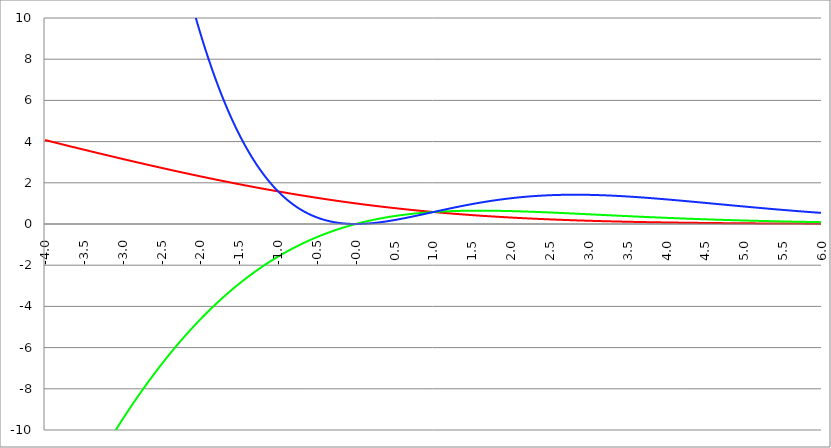
| Category | Series 1 | Series 0 | Series 2 |
|---|---|---|---|
| -4.0 | 4.075 | -16.299 | 65.194 |
| -3.995 | 4.07 | -16.259 | 64.956 |
| -3.99 | 4.065 | -16.22 | 64.718 |
| -3.985 | 4.06 | -16.181 | 64.482 |
| -3.98 | 4.056 | -16.142 | 64.245 |
| -3.975000000000001 | 4.051 | -16.103 | 64.01 |
| -3.970000000000001 | 4.046 | -16.064 | 63.774 |
| -3.965000000000001 | 4.042 | -16.025 | 63.54 |
| -3.960000000000001 | 4.037 | -15.986 | 63.306 |
| -3.955000000000001 | 4.032 | -15.948 | 63.073 |
| -3.950000000000001 | 4.028 | -15.909 | 62.84 |
| -3.945000000000001 | 4.023 | -15.87 | 62.608 |
| -3.940000000000001 | 4.018 | -15.831 | 62.376 |
| -3.935000000000001 | 4.013 | -15.793 | 62.145 |
| -3.930000000000001 | 4.009 | -15.754 | 61.915 |
| -3.925000000000002 | 4.004 | -15.716 | 61.685 |
| -3.920000000000002 | 3.999 | -15.677 | 61.456 |
| -3.915000000000002 | 3.995 | -15.639 | 61.227 |
| -3.910000000000002 | 3.99 | -15.601 | 60.999 |
| -3.905000000000002 | 3.985 | -15.562 | 60.771 |
| -3.900000000000002 | 3.981 | -15.524 | 60.545 |
| -3.895000000000002 | 3.976 | -15.486 | 60.318 |
| -3.890000000000002 | 3.971 | -15.448 | 60.092 |
| -3.885000000000002 | 3.967 | -15.41 | 59.867 |
| -3.880000000000002 | 3.962 | -15.372 | 59.643 |
| -3.875000000000003 | 3.957 | -15.334 | 59.419 |
| -3.870000000000003 | 3.952 | -15.296 | 59.195 |
| -3.865000000000003 | 3.948 | -15.258 | 58.972 |
| -3.860000000000003 | 3.943 | -15.22 | 58.75 |
| -3.855000000000003 | 3.938 | -15.182 | 58.529 |
| -3.850000000000003 | 3.934 | -15.145 | 58.307 |
| -3.845000000000003 | 3.929 | -15.107 | 58.087 |
| -3.840000000000003 | 3.924 | -15.069 | 57.867 |
| -3.835000000000003 | 3.92 | -15.032 | 57.647 |
| -3.830000000000004 | 3.915 | -14.994 | 57.429 |
| -3.825000000000004 | 3.91 | -14.957 | 57.21 |
| -3.820000000000004 | 3.906 | -14.92 | 56.993 |
| -3.815000000000004 | 3.901 | -14.882 | 56.776 |
| -3.810000000000004 | 3.896 | -14.845 | 56.559 |
| -3.805000000000004 | 3.892 | -14.808 | 56.343 |
| -3.800000000000004 | 3.887 | -14.77 | 56.128 |
| -3.795000000000004 | 3.882 | -14.733 | 55.913 |
| -3.790000000000004 | 3.878 | -14.696 | 55.698 |
| -3.785000000000004 | 3.873 | -14.659 | 55.485 |
| -3.780000000000005 | 3.868 | -14.622 | 55.272 |
| -3.775000000000005 | 3.864 | -14.585 | 55.059 |
| -3.770000000000005 | 3.859 | -14.548 | 54.847 |
| -3.765000000000005 | 3.854 | -14.511 | 54.635 |
| -3.760000000000005 | 3.85 | -14.475 | 54.425 |
| -3.755000000000005 | 3.845 | -14.438 | 54.214 |
| -3.750000000000005 | 3.84 | -14.401 | 54.004 |
| -3.745000000000005 | 3.836 | -14.365 | 53.795 |
| -3.740000000000005 | 3.831 | -14.328 | 53.587 |
| -3.735000000000006 | 3.826 | -14.291 | 53.378 |
| -3.730000000000006 | 3.822 | -14.255 | 53.171 |
| -3.725000000000006 | 3.817 | -14.218 | 52.964 |
| -3.720000000000006 | 3.812 | -14.182 | 52.757 |
| -3.715000000000006 | 3.808 | -14.146 | 52.551 |
| -3.710000000000006 | 3.803 | -14.109 | 52.346 |
| -3.705000000000006 | 3.798 | -14.073 | 52.141 |
| -3.700000000000006 | 3.794 | -14.037 | 51.937 |
| -3.695000000000006 | 3.789 | -14.001 | 51.733 |
| -3.690000000000006 | 3.785 | -13.965 | 51.53 |
| -3.685000000000007 | 3.78 | -13.929 | 51.328 |
| -3.680000000000007 | 3.775 | -13.893 | 51.126 |
| -3.675000000000007 | 3.771 | -13.857 | 50.924 |
| -3.670000000000007 | 3.766 | -13.821 | 50.723 |
| -3.665000000000007 | 3.761 | -13.785 | 50.523 |
| -3.660000000000007 | 3.757 | -13.749 | 50.323 |
| -3.655000000000007 | 3.752 | -13.714 | 50.124 |
| -3.650000000000007 | 3.747 | -13.678 | 49.925 |
| -3.645000000000007 | 3.743 | -13.642 | 49.726 |
| -3.640000000000008 | 3.738 | -13.607 | 49.529 |
| -3.635000000000008 | 3.734 | -13.571 | 49.332 |
| -3.630000000000008 | 3.729 | -13.536 | 49.135 |
| -3.625000000000008 | 3.724 | -13.5 | 48.939 |
| -3.620000000000008 | 3.72 | -13.465 | 48.743 |
| -3.615000000000008 | 3.715 | -13.43 | 48.548 |
| -3.610000000000008 | 3.71 | -13.394 | 48.354 |
| -3.605000000000008 | 3.706 | -13.359 | 48.16 |
| -3.600000000000008 | 3.701 | -13.324 | 47.967 |
| -3.595000000000009 | 3.697 | -13.289 | 47.774 |
| -3.590000000000009 | 3.692 | -13.254 | 47.581 |
| -3.585000000000009 | 3.687 | -13.219 | 47.39 |
| -3.580000000000009 | 3.683 | -13.184 | 47.198 |
| -3.575000000000009 | 3.678 | -13.149 | 47.008 |
| -3.570000000000009 | 3.673 | -13.114 | 46.817 |
| -3.565000000000009 | 3.669 | -13.079 | 46.628 |
| -3.560000000000009 | 3.664 | -13.045 | 46.439 |
| -3.555000000000009 | 3.66 | -13.01 | 46.25 |
| -3.55000000000001 | 3.655 | -12.975 | 46.062 |
| -3.54500000000001 | 3.65 | -12.941 | 45.874 |
| -3.54000000000001 | 3.646 | -12.906 | 45.687 |
| -3.53500000000001 | 3.641 | -12.872 | 45.501 |
| -3.53000000000001 | 3.637 | -12.837 | 45.315 |
| -3.52500000000001 | 3.632 | -12.803 | 45.129 |
| -3.52000000000001 | 3.627 | -12.768 | 44.945 |
| -3.51500000000001 | 3.623 | -12.734 | 44.76 |
| -3.51000000000001 | 3.618 | -12.7 | 44.576 |
| -3.505000000000011 | 3.614 | -12.666 | 44.393 |
| -3.500000000000011 | 3.609 | -12.631 | 44.21 |
| -3.495000000000011 | 3.604 | -12.597 | 44.028 |
| -3.490000000000011 | 3.6 | -12.563 | 43.846 |
| -3.485000000000011 | 3.595 | -12.529 | 43.665 |
| -3.480000000000011 | 3.591 | -12.495 | 43.484 |
| -3.475000000000011 | 3.586 | -12.461 | 43.304 |
| -3.470000000000011 | 3.581 | -12.428 | 43.124 |
| -3.465000000000011 | 3.577 | -12.394 | 42.945 |
| -3.460000000000011 | 3.572 | -12.36 | 42.766 |
| -3.455000000000012 | 3.568 | -12.326 | 42.588 |
| -3.450000000000012 | 3.563 | -12.293 | 42.41 |
| -3.445000000000012 | 3.559 | -12.259 | 42.233 |
| -3.440000000000012 | 3.554 | -12.226 | 42.056 |
| -3.435000000000012 | 3.549 | -12.192 | 41.88 |
| -3.430000000000012 | 3.545 | -12.159 | 41.704 |
| -3.425000000000012 | 3.54 | -12.125 | 41.529 |
| -3.420000000000012 | 3.536 | -12.092 | 41.354 |
| -3.415000000000012 | 3.531 | -12.059 | 41.18 |
| -3.410000000000013 | 3.527 | -12.025 | 41.007 |
| -3.405000000000013 | 3.522 | -11.992 | 40.834 |
| -3.400000000000013 | 3.517 | -11.959 | 40.661 |
| -3.395000000000013 | 3.513 | -11.926 | 40.489 |
| -3.390000000000013 | 3.508 | -11.893 | 40.317 |
| -3.385000000000013 | 3.504 | -11.86 | 40.146 |
| -3.380000000000013 | 3.499 | -11.827 | 39.976 |
| -3.375000000000013 | 3.495 | -11.794 | 39.805 |
| -3.370000000000013 | 3.49 | -11.761 | 39.636 |
| -3.365000000000013 | 3.485 | -11.729 | 39.467 |
| -3.360000000000014 | 3.481 | -11.696 | 39.298 |
| -3.355000000000014 | 3.476 | -11.663 | 39.13 |
| -3.350000000000014 | 3.472 | -11.631 | 38.962 |
| -3.345000000000014 | 3.467 | -11.598 | 38.795 |
| -3.340000000000014 | 3.463 | -11.565 | 38.629 |
| -3.335000000000014 | 3.458 | -11.533 | 38.462 |
| -3.330000000000014 | 3.454 | -11.501 | 38.297 |
| -3.325000000000014 | 3.449 | -11.468 | 38.132 |
| -3.320000000000014 | 3.445 | -11.436 | 37.967 |
| -3.315000000000015 | 3.44 | -11.404 | 37.803 |
| -3.310000000000015 | 3.435 | -11.371 | 37.639 |
| -3.305000000000015 | 3.431 | -11.339 | 37.476 |
| -3.300000000000015 | 3.426 | -11.307 | 37.313 |
| -3.295000000000015 | 3.422 | -11.275 | 37.151 |
| -3.290000000000015 | 3.417 | -11.243 | 36.989 |
| -3.285000000000015 | 3.413 | -11.211 | 36.828 |
| -3.280000000000015 | 3.408 | -11.179 | 36.667 |
| -3.275000000000015 | 3.404 | -11.147 | 36.507 |
| -3.270000000000016 | 3.399 | -11.115 | 36.347 |
| -3.265000000000016 | 3.395 | -11.084 | 36.188 |
| -3.260000000000016 | 3.39 | -11.052 | 36.029 |
| -3.255000000000016 | 3.386 | -11.02 | 35.871 |
| -3.250000000000016 | 3.381 | -10.989 | 35.713 |
| -3.245000000000016 | 3.377 | -10.957 | 35.555 |
| -3.240000000000016 | 3.372 | -10.925 | 35.399 |
| -3.235000000000016 | 3.368 | -10.894 | 35.242 |
| -3.230000000000016 | 3.363 | -10.863 | 35.086 |
| -3.225000000000016 | 3.359 | -10.831 | 34.931 |
| -3.220000000000016 | 3.354 | -10.8 | 34.776 |
| -3.215000000000017 | 3.35 | -10.769 | 34.621 |
| -3.210000000000017 | 3.345 | -10.737 | 34.467 |
| -3.205000000000017 | 3.34 | -10.706 | 34.314 |
| -3.200000000000017 | 3.336 | -10.675 | 34.16 |
| -3.195000000000017 | 3.331 | -10.644 | 34.008 |
| -3.190000000000017 | 3.327 | -10.613 | 33.856 |
| -3.185000000000017 | 3.322 | -10.582 | 33.704 |
| -3.180000000000017 | 3.318 | -10.551 | 33.553 |
| -3.175000000000018 | 3.313 | -10.52 | 33.402 |
| -3.170000000000018 | 3.309 | -10.489 | 33.252 |
| -3.165000000000018 | 3.304 | -10.459 | 33.102 |
| -3.160000000000018 | 3.3 | -10.428 | 32.953 |
| -3.155000000000018 | 3.296 | -10.397 | 32.804 |
| -3.150000000000018 | 3.291 | -10.367 | 32.655 |
| -3.145000000000018 | 3.287 | -10.336 | 32.507 |
| -3.140000000000018 | 3.282 | -10.306 | 32.36 |
| -3.135000000000018 | 3.278 | -10.275 | 32.213 |
| -3.130000000000019 | 3.273 | -10.245 | 32.066 |
| -3.125000000000019 | 3.269 | -10.214 | 31.92 |
| -3.120000000000019 | 3.264 | -10.184 | 31.774 |
| -3.115000000000019 | 3.26 | -10.154 | 31.629 |
| -3.110000000000019 | 3.255 | -10.124 | 31.484 |
| -3.10500000000002 | 3.251 | -10.093 | 31.34 |
| -3.10000000000002 | 3.246 | -10.063 | 31.196 |
| -3.095000000000019 | 3.242 | -10.033 | 31.053 |
| -3.090000000000019 | 3.237 | -10.003 | 30.91 |
| -3.085000000000019 | 3.233 | -9.973 | 30.768 |
| -3.08000000000002 | 3.228 | -9.943 | 30.626 |
| -3.07500000000002 | 3.224 | -9.914 | 30.484 |
| -3.07000000000002 | 3.219 | -9.884 | 30.343 |
| -3.06500000000002 | 3.215 | -9.854 | 30.202 |
| -3.06000000000002 | 3.211 | -9.824 | 30.062 |
| -3.05500000000002 | 3.206 | -9.795 | 29.922 |
| -3.05000000000002 | 3.202 | -9.765 | 29.783 |
| -3.04500000000002 | 3.197 | -9.735 | 29.644 |
| -3.04000000000002 | 3.193 | -9.706 | 29.506 |
| -3.035000000000021 | 3.188 | -9.676 | 29.368 |
| -3.030000000000021 | 3.184 | -9.647 | 29.23 |
| -3.025000000000021 | 3.179 | -9.618 | 29.093 |
| -3.020000000000021 | 3.175 | -9.588 | 28.957 |
| -3.015000000000021 | 3.17 | -9.559 | 28.821 |
| -3.010000000000021 | 3.166 | -9.53 | 28.685 |
| -3.005000000000021 | 3.162 | -9.501 | 28.55 |
| -3.000000000000021 | 3.157 | -9.472 | 28.415 |
| -2.995000000000021 | 3.153 | -9.442 | 28.28 |
| -2.990000000000021 | 3.148 | -9.413 | 28.146 |
| -2.985000000000022 | 3.144 | -9.385 | 28.013 |
| -2.980000000000022 | 3.139 | -9.356 | 27.88 |
| -2.975000000000022 | 3.135 | -9.327 | 27.747 |
| -2.970000000000022 | 3.131 | -9.298 | 27.615 |
| -2.965000000000022 | 3.126 | -9.269 | 27.483 |
| -2.960000000000022 | 3.122 | -9.24 | 27.352 |
| -2.955000000000022 | 3.117 | -9.212 | 27.221 |
| -2.950000000000022 | 3.113 | -9.183 | 27.09 |
| -2.945000000000022 | 3.109 | -9.155 | 26.96 |
| -2.940000000000023 | 3.104 | -9.126 | 26.831 |
| -2.935000000000023 | 3.1 | -9.098 | 26.701 |
| -2.930000000000023 | 3.095 | -9.069 | 26.573 |
| -2.925000000000023 | 3.091 | -9.041 | 26.444 |
| -2.920000000000023 | 3.086 | -9.012 | 26.316 |
| -2.915000000000023 | 3.082 | -8.984 | 26.189 |
| -2.910000000000023 | 3.078 | -8.956 | 26.062 |
| -2.905000000000023 | 3.073 | -8.928 | 25.935 |
| -2.900000000000023 | 3.069 | -8.9 | 25.809 |
| -2.895000000000023 | 3.064 | -8.872 | 25.683 |
| -2.890000000000024 | 3.06 | -8.844 | 25.558 |
| -2.885000000000024 | 3.056 | -8.816 | 25.433 |
| -2.880000000000024 | 3.051 | -8.788 | 25.309 |
| -2.875000000000024 | 3.047 | -8.76 | 25.184 |
| -2.870000000000024 | 3.043 | -8.732 | 25.061 |
| -2.865000000000024 | 3.038 | -8.704 | 24.938 |
| -2.860000000000024 | 3.034 | -8.676 | 24.815 |
| -2.855000000000024 | 3.029 | -8.649 | 24.692 |
| -2.850000000000024 | 3.025 | -8.621 | 24.57 |
| -2.845000000000025 | 3.021 | -8.594 | 24.449 |
| -2.840000000000025 | 3.016 | -8.566 | 24.328 |
| -2.835000000000025 | 3.012 | -8.539 | 24.207 |
| -2.830000000000025 | 3.007 | -8.511 | 24.087 |
| -2.825000000000025 | 3.003 | -8.484 | 23.967 |
| -2.820000000000025 | 2.999 | -8.456 | 23.847 |
| -2.815000000000025 | 2.994 | -8.429 | 23.728 |
| -2.810000000000025 | 2.99 | -8.402 | 23.609 |
| -2.805000000000025 | 2.986 | -8.375 | 23.491 |
| -2.800000000000026 | 2.981 | -8.348 | 23.373 |
| -2.795000000000026 | 2.977 | -8.321 | 23.256 |
| -2.790000000000026 | 2.973 | -8.293 | 23.139 |
| -2.785000000000026 | 2.968 | -8.267 | 23.022 |
| -2.780000000000026 | 2.964 | -8.24 | 22.906 |
| -2.775000000000026 | 2.96 | -8.213 | 22.79 |
| -2.770000000000026 | 2.955 | -8.186 | 22.675 |
| -2.765000000000026 | 2.951 | -8.159 | 22.56 |
| -2.760000000000026 | 2.946 | -8.132 | 22.445 |
| -2.755000000000026 | 2.942 | -8.106 | 22.331 |
| -2.750000000000027 | 2.938 | -8.079 | 22.217 |
| -2.745000000000027 | 2.933 | -8.052 | 22.104 |
| -2.740000000000027 | 2.929 | -8.026 | 21.991 |
| -2.735000000000027 | 2.925 | -7.999 | 21.878 |
| -2.730000000000027 | 2.92 | -7.973 | 21.766 |
| -2.725000000000027 | 2.916 | -7.946 | 21.654 |
| -2.720000000000027 | 2.912 | -7.92 | 21.543 |
| -2.715000000000027 | 2.907 | -7.894 | 21.432 |
| -2.710000000000027 | 2.903 | -7.868 | 21.321 |
| -2.705000000000028 | 2.899 | -7.841 | 21.211 |
| -2.700000000000028 | 2.895 | -7.815 | 21.101 |
| -2.695000000000028 | 2.89 | -7.789 | 20.992 |
| -2.690000000000028 | 2.886 | -7.763 | 20.883 |
| -2.685000000000028 | 2.882 | -7.737 | 20.774 |
| -2.680000000000028 | 2.877 | -7.711 | 20.666 |
| -2.675000000000028 | 2.873 | -7.685 | 20.558 |
| -2.670000000000028 | 2.869 | -7.659 | 20.45 |
| -2.665000000000028 | 2.864 | -7.634 | 20.343 |
| -2.660000000000028 | 2.86 | -7.608 | 20.237 |
| -2.655000000000029 | 2.856 | -7.582 | 20.13 |
| -2.650000000000029 | 2.851 | -7.556 | 20.024 |
| -2.645000000000029 | 2.847 | -7.531 | 19.919 |
| -2.640000000000029 | 2.843 | -7.505 | 19.814 |
| -2.635000000000029 | 2.839 | -7.48 | 19.709 |
| -2.630000000000029 | 2.834 | -7.454 | 19.605 |
| -2.625000000000029 | 2.83 | -7.429 | 19.501 |
| -2.620000000000029 | 2.826 | -7.403 | 19.397 |
| -2.615000000000029 | 2.821 | -7.378 | 19.294 |
| -2.61000000000003 | 2.817 | -7.353 | 19.191 |
| -2.60500000000003 | 2.813 | -7.328 | 19.088 |
| -2.60000000000003 | 2.809 | -7.302 | 18.986 |
| -2.59500000000003 | 2.804 | -7.277 | 18.884 |
| -2.59000000000003 | 2.8 | -7.252 | 18.783 |
| -2.58500000000003 | 2.796 | -7.227 | 18.682 |
| -2.58000000000003 | 2.792 | -7.202 | 18.582 |
| -2.57500000000003 | 2.787 | -7.177 | 18.481 |
| -2.57000000000003 | 2.783 | -7.152 | 18.381 |
| -2.565000000000031 | 2.779 | -7.127 | 18.282 |
| -2.560000000000031 | 2.774 | -7.103 | 18.183 |
| -2.555000000000031 | 2.77 | -7.078 | 18.084 |
| -2.550000000000031 | 2.766 | -7.053 | 17.986 |
| -2.545000000000031 | 2.762 | -7.029 | 17.888 |
| -2.540000000000031 | 2.757 | -7.004 | 17.79 |
| -2.535000000000031 | 2.753 | -6.979 | 17.693 |
| -2.530000000000031 | 2.749 | -6.955 | 17.596 |
| -2.525000000000031 | 2.745 | -6.93 | 17.499 |
| -2.520000000000032 | 2.74 | -6.906 | 17.403 |
| -2.515000000000032 | 2.736 | -6.882 | 17.307 |
| -2.510000000000032 | 2.732 | -6.857 | 17.212 |
| -2.505000000000032 | 2.728 | -6.833 | 17.117 |
| -2.500000000000032 | 2.724 | -6.809 | 17.022 |
| -2.495000000000032 | 2.719 | -6.785 | 16.928 |
| -2.490000000000032 | 2.715 | -6.761 | 16.834 |
| -2.485000000000032 | 2.711 | -6.737 | 16.74 |
| -2.480000000000032 | 2.707 | -6.713 | 16.647 |
| -2.475000000000032 | 2.702 | -6.689 | 16.554 |
| -2.470000000000033 | 2.698 | -6.665 | 16.462 |
| -2.465000000000033 | 2.694 | -6.641 | 16.369 |
| -2.460000000000033 | 2.69 | -6.617 | 16.278 |
| -2.455000000000033 | 2.686 | -6.593 | 16.186 |
| -2.450000000000033 | 2.681 | -6.569 | 16.095 |
| -2.445000000000033 | 2.677 | -6.546 | 16.004 |
| -2.440000000000033 | 2.673 | -6.522 | 15.914 |
| -2.435000000000033 | 2.669 | -6.498 | 15.824 |
| -2.430000000000033 | 2.665 | -6.475 | 15.734 |
| -2.425000000000034 | 2.66 | -6.451 | 15.645 |
| -2.420000000000034 | 2.656 | -6.428 | 15.556 |
| -2.415000000000034 | 2.652 | -6.405 | 15.467 |
| -2.410000000000034 | 2.648 | -6.381 | 15.379 |
| -2.405000000000034 | 2.644 | -6.358 | 15.291 |
| -2.400000000000034 | 2.639 | -6.335 | 15.203 |
| -2.395000000000034 | 2.635 | -6.311 | 15.116 |
| -2.390000000000034 | 2.631 | -6.288 | 15.029 |
| -2.385000000000034 | 2.627 | -6.265 | 14.942 |
| -2.380000000000034 | 2.623 | -6.242 | 14.856 |
| -2.375000000000035 | 2.619 | -6.219 | 14.77 |
| -2.370000000000035 | 2.614 | -6.196 | 14.685 |
| -2.365000000000035 | 2.61 | -6.173 | 14.6 |
| -2.360000000000035 | 2.606 | -6.15 | 14.515 |
| -2.355000000000035 | 2.602 | -6.127 | 14.43 |
| -2.350000000000035 | 2.598 | -6.105 | 14.346 |
| -2.345000000000035 | 2.594 | -6.082 | 14.262 |
| -2.340000000000035 | 2.589 | -6.059 | 14.179 |
| -2.335000000000035 | 2.585 | -6.037 | 14.096 |
| -2.330000000000036 | 2.581 | -6.014 | 14.013 |
| -2.325000000000036 | 2.577 | -5.991 | 13.93 |
| -2.320000000000036 | 2.573 | -5.969 | 13.848 |
| -2.315000000000036 | 2.569 | -5.947 | 13.766 |
| -2.310000000000036 | 2.565 | -5.924 | 13.685 |
| -2.305000000000036 | 2.56 | -5.902 | 13.604 |
| -2.300000000000036 | 2.556 | -5.879 | 13.523 |
| -2.295000000000036 | 2.552 | -5.857 | 13.442 |
| -2.290000000000036 | 2.548 | -5.835 | 13.362 |
| -2.285000000000036 | 2.544 | -5.813 | 13.282 |
| -2.280000000000036 | 2.54 | -5.791 | 13.203 |
| -2.275000000000037 | 2.536 | -5.769 | 13.124 |
| -2.270000000000037 | 2.532 | -5.747 | 13.045 |
| -2.265000000000037 | 2.527 | -5.725 | 12.966 |
| -2.260000000000037 | 2.523 | -5.703 | 12.888 |
| -2.255000000000037 | 2.519 | -5.681 | 12.81 |
| -2.250000000000037 | 2.515 | -5.659 | 12.733 |
| -2.245000000000037 | 2.511 | -5.637 | 12.655 |
| -2.240000000000037 | 2.507 | -5.615 | 12.579 |
| -2.235000000000038 | 2.503 | -5.594 | 12.502 |
| -2.230000000000038 | 2.499 | -5.572 | 12.426 |
| -2.225000000000038 | 2.495 | -5.55 | 12.35 |
| -2.220000000000038 | 2.49 | -5.529 | 12.274 |
| -2.215000000000038 | 2.486 | -5.507 | 12.199 |
| -2.210000000000038 | 2.482 | -5.486 | 12.124 |
| -2.205000000000038 | 2.478 | -5.464 | 12.049 |
| -2.200000000000038 | 2.474 | -5.443 | 11.975 |
| -2.195000000000038 | 2.47 | -5.422 | 11.901 |
| -2.190000000000039 | 2.466 | -5.401 | 11.827 |
| -2.185000000000039 | 2.462 | -5.379 | 11.754 |
| -2.180000000000039 | 2.458 | -5.358 | 11.681 |
| -2.175000000000039 | 2.454 | -5.337 | 11.608 |
| -2.170000000000039 | 2.45 | -5.316 | 11.535 |
| -2.16500000000004 | 2.446 | -5.295 | 11.463 |
| -2.16000000000004 | 2.442 | -5.274 | 11.391 |
| -2.155000000000039 | 2.438 | -5.253 | 11.32 |
| -2.150000000000039 | 2.433 | -5.232 | 11.249 |
| -2.14500000000004 | 2.429 | -5.211 | 11.178 |
| -2.14000000000004 | 2.425 | -5.19 | 11.107 |
| -2.13500000000004 | 2.421 | -5.169 | 11.037 |
| -2.13000000000004 | 2.417 | -5.149 | 10.967 |
| -2.12500000000004 | 2.413 | -5.128 | 10.897 |
| -2.12000000000004 | 2.409 | -5.107 | 10.828 |
| -2.11500000000004 | 2.405 | -5.087 | 10.759 |
| -2.11000000000004 | 2.401 | -5.066 | 10.69 |
| -2.10500000000004 | 2.397 | -5.046 | 10.621 |
| -2.10000000000004 | 2.393 | -5.025 | 10.553 |
| -2.095000000000041 | 2.389 | -5.005 | 10.485 |
| -2.090000000000041 | 2.385 | -4.985 | 10.418 |
| -2.085000000000041 | 2.381 | -4.964 | 10.351 |
| -2.080000000000041 | 2.377 | -4.944 | 10.284 |
| -2.075000000000041 | 2.373 | -4.924 | 10.217 |
| -2.070000000000041 | 2.369 | -4.904 | 10.151 |
| -2.065000000000041 | 2.365 | -4.884 | 10.085 |
| -2.060000000000041 | 2.361 | -4.863 | 10.019 |
| -2.055000000000041 | 2.357 | -4.843 | 9.953 |
| -2.050000000000042 | 2.353 | -4.823 | 9.888 |
| -2.045000000000042 | 2.349 | -4.804 | 9.823 |
| -2.040000000000042 | 2.345 | -4.784 | 9.759 |
| -2.035000000000042 | 2.341 | -4.764 | 9.694 |
| -2.030000000000042 | 2.337 | -4.744 | 9.63 |
| -2.025000000000042 | 2.333 | -4.724 | 9.566 |
| -2.020000000000042 | 2.329 | -4.704 | 9.503 |
| -2.015000000000042 | 2.325 | -4.685 | 9.44 |
| -2.010000000000042 | 2.321 | -4.665 | 9.377 |
| -2.005000000000043 | 2.317 | -4.646 | 9.314 |
| -2.000000000000043 | 2.313 | -4.626 | 9.252 |
| -1.995000000000043 | 2.309 | -4.607 | 9.19 |
| -1.990000000000043 | 2.305 | -4.587 | 9.128 |
| -1.985000000000043 | 2.301 | -4.568 | 9.067 |
| -1.980000000000043 | 2.297 | -4.548 | 9.006 |
| -1.975000000000043 | 2.293 | -4.529 | 8.945 |
| -1.970000000000043 | 2.289 | -4.51 | 8.884 |
| -1.965000000000043 | 2.285 | -4.491 | 8.824 |
| -1.960000000000043 | 2.281 | -4.471 | 8.764 |
| -1.955000000000044 | 2.277 | -4.452 | 8.704 |
| -1.950000000000044 | 2.273 | -4.433 | 8.645 |
| -1.945000000000044 | 2.27 | -4.414 | 8.586 |
| -1.940000000000044 | 2.266 | -4.395 | 8.527 |
| -1.935000000000044 | 2.262 | -4.376 | 8.468 |
| -1.930000000000044 | 2.258 | -4.357 | 8.41 |
| -1.925000000000044 | 2.254 | -4.339 | 8.352 |
| -1.920000000000044 | 2.25 | -4.32 | 8.294 |
| -1.915000000000044 | 2.246 | -4.301 | 8.236 |
| -1.910000000000045 | 2.242 | -4.282 | 8.179 |
| -1.905000000000045 | 2.238 | -4.264 | 8.122 |
| -1.900000000000045 | 2.234 | -4.245 | 8.065 |
| -1.895000000000045 | 2.23 | -4.226 | 8.009 |
| -1.890000000000045 | 2.226 | -4.208 | 7.953 |
| -1.885000000000045 | 2.222 | -4.189 | 7.897 |
| -1.880000000000045 | 2.219 | -4.171 | 7.841 |
| -1.875000000000045 | 2.215 | -4.152 | 7.786 |
| -1.870000000000045 | 2.211 | -4.134 | 7.731 |
| -1.865000000000045 | 2.207 | -4.116 | 7.676 |
| -1.860000000000046 | 2.203 | -4.097 | 7.621 |
| -1.855000000000046 | 2.199 | -4.079 | 7.567 |
| -1.850000000000046 | 2.195 | -4.061 | 7.513 |
| -1.845000000000046 | 2.191 | -4.043 | 7.459 |
| -1.840000000000046 | 2.187 | -4.025 | 7.406 |
| -1.835000000000046 | 2.184 | -4.007 | 7.352 |
| -1.830000000000046 | 2.18 | -3.989 | 7.299 |
| -1.825000000000046 | 2.176 | -3.971 | 7.247 |
| -1.820000000000046 | 2.172 | -3.953 | 7.194 |
| -1.815000000000047 | 2.168 | -3.935 | 7.142 |
| -1.810000000000047 | 2.164 | -3.917 | 7.09 |
| -1.805000000000047 | 2.16 | -3.899 | 7.038 |
| -1.800000000000047 | 2.156 | -3.882 | 6.987 |
| -1.795000000000047 | 2.153 | -3.864 | 6.936 |
| -1.790000000000047 | 2.149 | -3.846 | 6.885 |
| -1.785000000000047 | 2.145 | -3.829 | 6.834 |
| -1.780000000000047 | 2.141 | -3.811 | 6.784 |
| -1.775000000000047 | 2.137 | -3.794 | 6.734 |
| -1.770000000000047 | 2.133 | -3.776 | 6.684 |
| -1.765000000000048 | 2.13 | -3.759 | 6.634 |
| -1.760000000000048 | 2.126 | -3.741 | 6.585 |
| -1.755000000000048 | 2.122 | -3.724 | 6.535 |
| -1.750000000000048 | 2.118 | -3.707 | 6.487 |
| -1.745000000000048 | 2.114 | -3.689 | 6.438 |
| -1.740000000000048 | 2.11 | -3.672 | 6.39 |
| -1.735000000000048 | 2.107 | -3.655 | 6.341 |
| -1.730000000000048 | 2.103 | -3.638 | 6.293 |
| -1.725000000000048 | 2.099 | -3.621 | 6.246 |
| -1.720000000000049 | 2.095 | -3.604 | 6.198 |
| -1.715000000000049 | 2.091 | -3.587 | 6.151 |
| -1.710000000000049 | 2.088 | -3.57 | 6.104 |
| -1.705000000000049 | 2.084 | -3.553 | 6.058 |
| -1.700000000000049 | 2.08 | -3.536 | 6.011 |
| -1.69500000000005 | 2.076 | -3.519 | 5.965 |
| -1.69000000000005 | 2.072 | -3.502 | 5.919 |
| -1.685000000000049 | 2.069 | -3.486 | 5.873 |
| -1.680000000000049 | 2.065 | -3.469 | 5.828 |
| -1.675000000000049 | 2.061 | -3.452 | 5.783 |
| -1.67000000000005 | 2.057 | -3.436 | 5.738 |
| -1.66500000000005 | 2.054 | -3.419 | 5.693 |
| -1.66000000000005 | 2.05 | -3.403 | 5.648 |
| -1.65500000000005 | 2.046 | -3.386 | 5.604 |
| -1.65000000000005 | 2.042 | -3.37 | 5.56 |
| -1.64500000000005 | 2.038 | -3.353 | 5.516 |
| -1.64000000000005 | 2.035 | -3.337 | 5.472 |
| -1.63500000000005 | 2.031 | -3.321 | 5.429 |
| -1.63000000000005 | 2.027 | -3.304 | 5.386 |
| -1.625000000000051 | 2.023 | -3.288 | 5.343 |
| -1.620000000000051 | 2.02 | -3.272 | 5.3 |
| -1.615000000000051 | 2.016 | -3.256 | 5.258 |
| -1.610000000000051 | 2.012 | -3.24 | 5.216 |
| -1.605000000000051 | 2.008 | -3.224 | 5.174 |
| -1.600000000000051 | 2.005 | -3.208 | 5.132 |
| -1.595000000000051 | 2.001 | -3.192 | 5.091 |
| -1.590000000000051 | 1.997 | -3.176 | 5.049 |
| -1.585000000000051 | 1.994 | -3.16 | 5.008 |
| -1.580000000000052 | 1.99 | -3.144 | 4.967 |
| -1.575000000000052 | 1.986 | -3.128 | 4.927 |
| -1.570000000000052 | 1.982 | -3.112 | 4.887 |
| -1.565000000000052 | 1.979 | -3.097 | 4.846 |
| -1.560000000000052 | 1.975 | -3.081 | 4.806 |
| -1.555000000000052 | 1.971 | -3.065 | 4.767 |
| -1.550000000000052 | 1.968 | -3.05 | 4.727 |
| -1.545000000000052 | 1.964 | -3.034 | 4.688 |
| -1.540000000000052 | 1.96 | -3.019 | 4.649 |
| -1.535000000000053 | 1.957 | -3.003 | 4.61 |
| -1.530000000000053 | 1.953 | -2.988 | 4.571 |
| -1.525000000000053 | 1.949 | -2.973 | 4.533 |
| -1.520000000000053 | 1.946 | -2.957 | 4.495 |
| -1.515000000000053 | 1.942 | -2.942 | 4.457 |
| -1.510000000000053 | 1.938 | -2.927 | 4.419 |
| -1.505000000000053 | 1.934 | -2.911 | 4.382 |
| -1.500000000000053 | 1.931 | -2.896 | 4.344 |
| -1.495000000000053 | 1.927 | -2.881 | 4.307 |
| -1.490000000000053 | 1.924 | -2.866 | 4.27 |
| -1.485000000000054 | 1.92 | -2.851 | 4.234 |
| -1.480000000000054 | 1.916 | -2.836 | 4.197 |
| -1.475000000000054 | 1.913 | -2.821 | 4.161 |
| -1.470000000000054 | 1.909 | -2.806 | 4.125 |
| -1.465000000000054 | 1.905 | -2.791 | 4.089 |
| -1.460000000000054 | 1.902 | -2.776 | 4.054 |
| -1.455000000000054 | 1.898 | -2.762 | 4.018 |
| -1.450000000000054 | 1.894 | -2.747 | 3.983 |
| -1.445000000000054 | 1.891 | -2.732 | 3.948 |
| -1.440000000000055 | 1.887 | -2.717 | 3.913 |
| -1.435000000000055 | 1.883 | -2.703 | 3.879 |
| -1.430000000000055 | 1.88 | -2.688 | 3.844 |
| -1.425000000000055 | 1.876 | -2.674 | 3.81 |
| -1.420000000000055 | 1.873 | -2.659 | 3.776 |
| -1.415000000000055 | 1.869 | -2.645 | 3.742 |
| -1.410000000000055 | 1.865 | -2.63 | 3.709 |
| -1.405000000000055 | 1.862 | -2.616 | 3.675 |
| -1.400000000000055 | 1.858 | -2.602 | 3.642 |
| -1.395000000000055 | 1.855 | -2.587 | 3.609 |
| -1.390000000000056 | 1.851 | -2.573 | 3.576 |
| -1.385000000000056 | 1.847 | -2.559 | 3.544 |
| -1.380000000000056 | 1.844 | -2.545 | 3.511 |
| -1.375000000000056 | 1.84 | -2.53 | 3.479 |
| -1.370000000000056 | 1.837 | -2.516 | 3.447 |
| -1.365000000000056 | 1.833 | -2.502 | 3.416 |
| -1.360000000000056 | 1.83 | -2.488 | 3.384 |
| -1.355000000000056 | 1.826 | -2.474 | 3.353 |
| -1.350000000000056 | 1.822 | -2.46 | 3.321 |
| -1.345000000000057 | 1.819 | -2.446 | 3.29 |
| -1.340000000000057 | 1.815 | -2.433 | 3.26 |
| -1.335000000000057 | 1.812 | -2.419 | 3.229 |
| -1.330000000000057 | 1.808 | -2.405 | 3.199 |
| -1.325000000000057 | 1.805 | -2.391 | 3.168 |
| -1.320000000000057 | 1.801 | -2.378 | 3.138 |
| -1.315000000000057 | 1.798 | -2.364 | 3.108 |
| -1.310000000000057 | 1.794 | -2.35 | 3.079 |
| -1.305000000000057 | 1.791 | -2.337 | 3.049 |
| -1.300000000000058 | 1.787 | -2.323 | 3.02 |
| -1.295000000000058 | 1.783 | -2.31 | 2.991 |
| -1.290000000000058 | 1.78 | -2.296 | 2.962 |
| -1.285000000000058 | 1.776 | -2.283 | 2.933 |
| -1.280000000000058 | 1.773 | -2.269 | 2.905 |
| -1.275000000000058 | 1.769 | -2.256 | 2.876 |
| -1.270000000000058 | 1.766 | -2.243 | 2.848 |
| -1.265000000000058 | 1.762 | -2.229 | 2.82 |
| -1.260000000000058 | 1.759 | -2.216 | 2.792 |
| -1.255000000000058 | 1.755 | -2.203 | 2.765 |
| -1.250000000000059 | 1.752 | -2.19 | 2.737 |
| -1.245000000000059 | 1.748 | -2.177 | 2.71 |
| -1.240000000000059 | 1.745 | -2.164 | 2.683 |
| -1.235000000000059 | 1.741 | -2.151 | 2.656 |
| -1.23000000000006 | 1.738 | -2.138 | 2.629 |
| -1.225000000000059 | 1.735 | -2.125 | 2.603 |
| -1.220000000000059 | 1.731 | -2.112 | 2.577 |
| -1.215000000000059 | 1.728 | -2.099 | 2.55 |
| -1.210000000000059 | 1.724 | -2.086 | 2.524 |
| -1.20500000000006 | 1.721 | -2.073 | 2.498 |
| -1.20000000000006 | 1.717 | -2.061 | 2.473 |
| -1.19500000000006 | 1.714 | -2.048 | 2.447 |
| -1.19000000000006 | 1.71 | -2.035 | 2.422 |
| -1.18500000000006 | 1.707 | -2.023 | 2.397 |
| -1.18000000000006 | 1.703 | -2.01 | 2.372 |
| -1.17500000000006 | 1.7 | -1.997 | 2.347 |
| -1.17000000000006 | 1.697 | -1.985 | 2.322 |
| -1.16500000000006 | 1.693 | -1.972 | 2.298 |
| -1.160000000000061 | 1.69 | -1.96 | 2.274 |
| -1.155000000000061 | 1.686 | -1.948 | 2.25 |
| -1.150000000000061 | 1.683 | -1.935 | 2.226 |
| -1.145000000000061 | 1.679 | -1.923 | 2.202 |
| -1.140000000000061 | 1.676 | -1.911 | 2.178 |
| -1.135000000000061 | 1.673 | -1.898 | 2.155 |
| -1.130000000000061 | 1.669 | -1.886 | 2.131 |
| -1.125000000000061 | 1.666 | -1.874 | 2.108 |
| -1.120000000000061 | 1.662 | -1.862 | 2.085 |
| -1.115000000000061 | 1.659 | -1.85 | 2.063 |
| -1.110000000000062 | 1.656 | -1.838 | 2.04 |
| -1.105000000000062 | 1.652 | -1.826 | 2.017 |
| -1.100000000000062 | 1.649 | -1.814 | 1.995 |
| -1.095000000000062 | 1.645 | -1.802 | 1.973 |
| -1.090000000000062 | 1.642 | -1.79 | 1.951 |
| -1.085000000000062 | 1.639 | -1.778 | 1.929 |
| -1.080000000000062 | 1.635 | -1.766 | 1.907 |
| -1.075000000000062 | 1.632 | -1.754 | 1.886 |
| -1.070000000000062 | 1.629 | -1.743 | 1.865 |
| -1.065000000000063 | 1.625 | -1.731 | 1.843 |
| -1.060000000000063 | 1.622 | -1.719 | 1.822 |
| -1.055000000000063 | 1.619 | -1.708 | 1.802 |
| -1.050000000000063 | 1.615 | -1.696 | 1.781 |
| -1.045000000000063 | 1.612 | -1.684 | 1.76 |
| -1.040000000000063 | 1.609 | -1.673 | 1.74 |
| -1.035000000000063 | 1.605 | -1.661 | 1.72 |
| -1.030000000000063 | 1.602 | -1.65 | 1.699 |
| -1.025000000000063 | 1.599 | -1.639 | 1.679 |
| -1.020000000000064 | 1.595 | -1.627 | 1.66 |
| -1.015000000000064 | 1.592 | -1.616 | 1.64 |
| -1.010000000000064 | 1.589 | -1.604 | 1.621 |
| -1.005000000000064 | 1.585 | -1.593 | 1.601 |
| -1.000000000000064 | 1.582 | -1.582 | 1.582 |
| -0.995000000000064 | 1.579 | -1.571 | 1.563 |
| -0.990000000000064 | 1.575 | -1.56 | 1.544 |
| -0.985000000000064 | 1.572 | -1.548 | 1.525 |
| -0.980000000000064 | 1.569 | -1.537 | 1.507 |
| -0.975000000000064 | 1.565 | -1.526 | 1.488 |
| -0.970000000000064 | 1.562 | -1.515 | 1.47 |
| -0.965000000000064 | 1.559 | -1.504 | 1.452 |
| -0.960000000000064 | 1.556 | -1.493 | 1.434 |
| -0.955000000000064 | 1.552 | -1.483 | 1.416 |
| -0.950000000000064 | 1.549 | -1.472 | 1.398 |
| -0.945000000000064 | 1.546 | -1.461 | 1.38 |
| -0.940000000000064 | 1.543 | -1.45 | 1.363 |
| -0.935000000000064 | 1.539 | -1.439 | 1.346 |
| -0.930000000000064 | 1.536 | -1.429 | 1.329 |
| -0.925000000000064 | 1.533 | -1.418 | 1.312 |
| -0.920000000000064 | 1.53 | -1.407 | 1.295 |
| -0.915000000000064 | 1.526 | -1.397 | 1.278 |
| -0.910000000000064 | 1.523 | -1.386 | 1.261 |
| -0.905000000000064 | 1.52 | -1.375 | 1.245 |
| -0.900000000000064 | 1.517 | -1.365 | 1.228 |
| -0.895000000000064 | 1.513 | -1.354 | 1.212 |
| -0.890000000000064 | 1.51 | -1.344 | 1.196 |
| -0.885000000000064 | 1.507 | -1.334 | 1.18 |
| -0.880000000000064 | 1.504 | -1.323 | 1.164 |
| -0.875000000000064 | 1.501 | -1.313 | 1.149 |
| -0.870000000000064 | 1.497 | -1.303 | 1.133 |
| -0.865000000000064 | 1.494 | -1.292 | 1.118 |
| -0.860000000000064 | 1.491 | -1.282 | 1.103 |
| -0.855000000000064 | 1.488 | -1.272 | 1.088 |
| -0.850000000000064 | 1.484 | -1.262 | 1.073 |
| -0.845000000000064 | 1.481 | -1.252 | 1.058 |
| -0.840000000000064 | 1.478 | -1.242 | 1.043 |
| -0.835000000000064 | 1.475 | -1.232 | 1.028 |
| -0.830000000000064 | 1.472 | -1.222 | 1.014 |
| -0.825000000000064 | 1.469 | -1.212 | 1 |
| -0.820000000000064 | 1.465 | -1.202 | 0.985 |
| -0.815000000000064 | 1.462 | -1.192 | 0.971 |
| -0.810000000000064 | 1.459 | -1.182 | 0.957 |
| -0.805000000000064 | 1.456 | -1.172 | 0.943 |
| -0.800000000000064 | 1.453 | -1.162 | 0.93 |
| -0.795000000000064 | 1.45 | -1.152 | 0.916 |
| -0.790000000000064 | 1.446 | -1.143 | 0.903 |
| -0.785000000000064 | 1.443 | -1.133 | 0.889 |
| -0.780000000000064 | 1.44 | -1.123 | 0.876 |
| -0.775000000000064 | 1.437 | -1.114 | 0.863 |
| -0.770000000000064 | 1.434 | -1.104 | 0.85 |
| -0.765000000000064 | 1.431 | -1.095 | 0.837 |
| -0.760000000000064 | 1.428 | -1.085 | 0.825 |
| -0.755000000000064 | 1.425 | -1.076 | 0.812 |
| -0.750000000000064 | 1.421 | -1.066 | 0.8 |
| -0.745000000000064 | 1.418 | -1.057 | 0.787 |
| -0.740000000000064 | 1.415 | -1.047 | 0.775 |
| -0.735000000000064 | 1.412 | -1.038 | 0.763 |
| -0.730000000000064 | 1.409 | -1.029 | 0.751 |
| -0.725000000000064 | 1.406 | -1.019 | 0.739 |
| -0.720000000000064 | 1.403 | -1.01 | 0.727 |
| -0.715000000000064 | 1.4 | -1.001 | 0.716 |
| -0.710000000000064 | 1.397 | -0.992 | 0.704 |
| -0.705000000000064 | 1.394 | -0.982 | 0.693 |
| -0.700000000000064 | 1.391 | -0.973 | 0.681 |
| -0.695000000000064 | 1.387 | -0.964 | 0.67 |
| -0.690000000000064 | 1.384 | -0.955 | 0.659 |
| -0.685000000000064 | 1.381 | -0.946 | 0.648 |
| -0.680000000000064 | 1.378 | -0.937 | 0.637 |
| -0.675000000000064 | 1.375 | -0.928 | 0.627 |
| -0.670000000000064 | 1.372 | -0.919 | 0.616 |
| -0.665000000000064 | 1.369 | -0.91 | 0.605 |
| -0.660000000000064 | 1.366 | -0.902 | 0.595 |
| -0.655000000000064 | 1.363 | -0.893 | 0.585 |
| -0.650000000000064 | 1.36 | -0.884 | 0.575 |
| -0.645000000000064 | 1.357 | -0.875 | 0.565 |
| -0.640000000000064 | 1.354 | -0.866 | 0.555 |
| -0.635000000000064 | 1.351 | -0.858 | 0.545 |
| -0.630000000000064 | 1.348 | -0.849 | 0.535 |
| -0.625000000000064 | 1.345 | -0.841 | 0.525 |
| -0.620000000000064 | 1.342 | -0.832 | 0.516 |
| -0.615000000000064 | 1.339 | -0.823 | 0.506 |
| -0.610000000000064 | 1.336 | -0.815 | 0.497 |
| -0.605000000000064 | 1.333 | -0.806 | 0.488 |
| -0.600000000000064 | 1.33 | -0.798 | 0.479 |
| -0.595000000000064 | 1.327 | -0.789 | 0.47 |
| -0.590000000000064 | 1.324 | -0.781 | 0.461 |
| -0.585000000000064 | 1.321 | -0.773 | 0.452 |
| -0.580000000000064 | 1.318 | -0.764 | 0.443 |
| -0.575000000000064 | 1.315 | -0.756 | 0.435 |
| -0.570000000000064 | 1.312 | -0.748 | 0.426 |
| -0.565000000000064 | 1.309 | -0.74 | 0.418 |
| -0.560000000000064 | 1.306 | -0.731 | 0.41 |
| -0.555000000000064 | 1.303 | -0.723 | 0.401 |
| -0.550000000000064 | 1.3 | -0.715 | 0.393 |
| -0.545000000000064 | 1.297 | -0.707 | 0.385 |
| -0.540000000000064 | 1.294 | -0.699 | 0.377 |
| -0.535000000000064 | 1.291 | -0.691 | 0.37 |
| -0.530000000000064 | 1.288 | -0.683 | 0.362 |
| -0.525000000000064 | 1.285 | -0.675 | 0.354 |
| -0.520000000000064 | 1.282 | -0.667 | 0.347 |
| -0.515000000000064 | 1.28 | -0.659 | 0.339 |
| -0.510000000000064 | 1.277 | -0.651 | 0.332 |
| -0.505000000000064 | 1.274 | -0.643 | 0.325 |
| -0.500000000000064 | 1.271 | -0.635 | 0.318 |
| -0.495000000000063 | 1.268 | -0.628 | 0.311 |
| -0.490000000000063 | 1.265 | -0.62 | 0.304 |
| -0.485000000000063 | 1.262 | -0.612 | 0.297 |
| -0.480000000000063 | 1.259 | -0.604 | 0.29 |
| -0.475000000000063 | 1.256 | -0.597 | 0.283 |
| -0.470000000000063 | 1.253 | -0.589 | 0.277 |
| -0.465000000000063 | 1.25 | -0.581 | 0.27 |
| -0.460000000000063 | 1.248 | -0.574 | 0.264 |
| -0.455000000000063 | 1.245 | -0.566 | 0.258 |
| -0.450000000000063 | 1.242 | -0.559 | 0.251 |
| -0.445000000000063 | 1.239 | -0.551 | 0.245 |
| -0.440000000000063 | 1.236 | -0.544 | 0.239 |
| -0.435000000000063 | 1.233 | -0.536 | 0.233 |
| -0.430000000000063 | 1.23 | -0.529 | 0.227 |
| -0.425000000000063 | 1.228 | -0.522 | 0.222 |
| -0.420000000000063 | 1.225 | -0.514 | 0.216 |
| -0.415000000000063 | 1.222 | -0.507 | 0.21 |
| -0.410000000000063 | 1.219 | -0.5 | 0.205 |
| -0.405000000000063 | 1.216 | -0.493 | 0.199 |
| -0.400000000000063 | 1.213 | -0.485 | 0.194 |
| -0.395000000000063 | 1.21 | -0.478 | 0.189 |
| -0.390000000000063 | 1.208 | -0.471 | 0.184 |
| -0.385000000000063 | 1.205 | -0.464 | 0.179 |
| -0.380000000000063 | 1.202 | -0.457 | 0.174 |
| -0.375000000000063 | 1.199 | -0.45 | 0.169 |
| -0.370000000000063 | 1.196 | -0.443 | 0.164 |
| -0.365000000000063 | 1.194 | -0.436 | 0.159 |
| -0.360000000000063 | 1.191 | -0.429 | 0.154 |
| -0.355000000000063 | 1.188 | -0.422 | 0.15 |
| -0.350000000000063 | 1.185 | -0.415 | 0.145 |
| -0.345000000000063 | 1.182 | -0.408 | 0.141 |
| -0.340000000000063 | 1.18 | -0.401 | 0.136 |
| -0.335000000000063 | 1.177 | -0.394 | 0.132 |
| -0.330000000000063 | 1.174 | -0.387 | 0.128 |
| -0.325000000000063 | 1.171 | -0.381 | 0.124 |
| -0.320000000000063 | 1.169 | -0.374 | 0.12 |
| -0.315000000000063 | 1.166 | -0.367 | 0.116 |
| -0.310000000000063 | 1.163 | -0.361 | 0.112 |
| -0.305000000000063 | 1.16 | -0.354 | 0.108 |
| -0.300000000000063 | 1.157 | -0.347 | 0.104 |
| -0.295000000000063 | 1.155 | -0.341 | 0.1 |
| -0.290000000000063 | 1.152 | -0.334 | 0.097 |
| -0.285000000000063 | 1.149 | -0.328 | 0.093 |
| -0.280000000000063 | 1.147 | -0.321 | 0.09 |
| -0.275000000000063 | 1.144 | -0.315 | 0.086 |
| -0.270000000000063 | 1.141 | -0.308 | 0.083 |
| -0.265000000000063 | 1.138 | -0.302 | 0.08 |
| -0.260000000000063 | 1.136 | -0.295 | 0.077 |
| -0.255000000000063 | 1.133 | -0.289 | 0.074 |
| -0.250000000000063 | 1.13 | -0.283 | 0.071 |
| -0.245000000000063 | 1.127 | -0.276 | 0.068 |
| -0.240000000000063 | 1.125 | -0.27 | 0.065 |
| -0.235000000000063 | 1.122 | -0.264 | 0.062 |
| -0.230000000000063 | 1.119 | -0.257 | 0.059 |
| -0.225000000000063 | 1.117 | -0.251 | 0.057 |
| -0.220000000000063 | 1.114 | -0.245 | 0.054 |
| -0.215000000000063 | 1.111 | -0.239 | 0.051 |
| -0.210000000000063 | 1.109 | -0.233 | 0.049 |
| -0.205000000000063 | 1.106 | -0.227 | 0.046 |
| -0.200000000000063 | 1.103 | -0.221 | 0.044 |
| -0.195000000000063 | 1.101 | -0.215 | 0.042 |
| -0.190000000000063 | 1.098 | -0.209 | 0.04 |
| -0.185000000000063 | 1.095 | -0.203 | 0.037 |
| -0.180000000000063 | 1.093 | -0.197 | 0.035 |
| -0.175000000000063 | 1.09 | -0.191 | 0.033 |
| -0.170000000000063 | 1.087 | -0.185 | 0.031 |
| -0.165000000000063 | 1.085 | -0.179 | 0.03 |
| -0.160000000000063 | 1.082 | -0.173 | 0.028 |
| -0.155000000000063 | 1.08 | -0.167 | 0.026 |
| -0.150000000000063 | 1.077 | -0.162 | 0.024 |
| -0.145000000000063 | 1.074 | -0.156 | 0.023 |
| -0.140000000000063 | 1.072 | -0.15 | 0.021 |
| -0.135000000000063 | 1.069 | -0.144 | 0.019 |
| -0.130000000000063 | 1.066 | -0.139 | 0.018 |
| -0.125000000000063 | 1.064 | -0.133 | 0.017 |
| -0.120000000000063 | 1.061 | -0.127 | 0.015 |
| -0.115000000000063 | 1.059 | -0.122 | 0.014 |
| -0.110000000000063 | 1.056 | -0.116 | 0.013 |
| -0.105000000000063 | 1.053 | -0.111 | 0.012 |
| -0.100000000000063 | 1.051 | -0.105 | 0.011 |
| -0.0950000000000631 | 1.048 | -0.1 | 0.009 |
| -0.0900000000000631 | 1.046 | -0.094 | 0.008 |
| -0.0850000000000631 | 1.043 | -0.089 | 0.008 |
| -0.0800000000000631 | 1.041 | -0.083 | 0.007 |
| -0.0750000000000631 | 1.038 | -0.078 | 0.006 |
| -0.0700000000000631 | 1.035 | -0.072 | 0.005 |
| -0.0650000000000631 | 1.033 | -0.067 | 0.004 |
| -0.0600000000000631 | 1.03 | -0.062 | 0.004 |
| -0.0550000000000631 | 1.028 | -0.057 | 0.003 |
| -0.0500000000000631 | 1.025 | -0.051 | 0.003 |
| -0.0450000000000631 | 1.023 | -0.046 | 0.002 |
| -0.0400000000000631 | 1.02 | -0.041 | 0.002 |
| -0.0350000000000631 | 1.018 | -0.036 | 0.001 |
| -0.0300000000000631 | 1.015 | -0.03 | 0.001 |
| -0.0250000000000631 | 1.013 | -0.025 | 0.001 |
| -0.0200000000000631 | 1.01 | -0.02 | 0 |
| -0.0150000000000631 | 1.008 | -0.015 | 0 |
| -0.0100000000000631 | 1.005 | -0.01 | 0 |
| -0.00500000000006313 | 1.003 | -0.005 | 0 |
| -6.3128322014272e-14 | 0.999 | 0 | 0 |
| 0.00499999999993687 | 0.998 | 0.005 | 0 |
| 0.00999999999993687 | 0.995 | 0.01 | 0 |
| 0.0149999999999369 | 0.993 | 0.015 | 0 |
| 0.0199999999999369 | 0.99 | 0.02 | 0 |
| 0.0249999999999369 | 0.988 | 0.025 | 0.001 |
| 0.0299999999999369 | 0.985 | 0.03 | 0.001 |
| 0.0349999999999369 | 0.983 | 0.034 | 0.001 |
| 0.0399999999999369 | 0.98 | 0.039 | 0.002 |
| 0.0449999999999369 | 0.978 | 0.044 | 0.002 |
| 0.0499999999999369 | 0.975 | 0.049 | 0.002 |
| 0.0549999999999369 | 0.973 | 0.054 | 0.003 |
| 0.0599999999999368 | 0.97 | 0.058 | 0.003 |
| 0.0649999999999368 | 0.968 | 0.063 | 0.004 |
| 0.0699999999999368 | 0.965 | 0.068 | 0.005 |
| 0.0749999999999369 | 0.963 | 0.072 | 0.005 |
| 0.0799999999999369 | 0.961 | 0.077 | 0.006 |
| 0.0849999999999369 | 0.958 | 0.081 | 0.007 |
| 0.0899999999999369 | 0.956 | 0.086 | 0.008 |
| 0.0949999999999369 | 0.953 | 0.091 | 0.009 |
| 0.0999999999999369 | 0.951 | 0.095 | 0.01 |
| 0.104999999999937 | 0.948 | 0.1 | 0.01 |
| 0.109999999999937 | 0.946 | 0.104 | 0.011 |
| 0.114999999999937 | 0.944 | 0.109 | 0.012 |
| 0.119999999999937 | 0.941 | 0.113 | 0.014 |
| 0.124999999999937 | 0.939 | 0.117 | 0.015 |
| 0.129999999999937 | 0.936 | 0.122 | 0.016 |
| 0.134999999999937 | 0.934 | 0.126 | 0.017 |
| 0.139999999999937 | 0.932 | 0.13 | 0.018 |
| 0.144999999999937 | 0.929 | 0.135 | 0.02 |
| 0.149999999999937 | 0.927 | 0.139 | 0.021 |
| 0.154999999999937 | 0.925 | 0.143 | 0.022 |
| 0.159999999999937 | 0.922 | 0.148 | 0.024 |
| 0.164999999999937 | 0.92 | 0.152 | 0.025 |
| 0.169999999999937 | 0.917 | 0.156 | 0.027 |
| 0.174999999999937 | 0.915 | 0.16 | 0.028 |
| 0.179999999999937 | 0.913 | 0.164 | 0.03 |
| 0.184999999999937 | 0.91 | 0.168 | 0.031 |
| 0.189999999999937 | 0.908 | 0.173 | 0.033 |
| 0.194999999999937 | 0.906 | 0.177 | 0.034 |
| 0.199999999999937 | 0.903 | 0.181 | 0.036 |
| 0.204999999999937 | 0.901 | 0.185 | 0.038 |
| 0.209999999999937 | 0.899 | 0.189 | 0.04 |
| 0.214999999999937 | 0.896 | 0.193 | 0.041 |
| 0.219999999999937 | 0.894 | 0.197 | 0.043 |
| 0.224999999999937 | 0.892 | 0.201 | 0.045 |
| 0.229999999999937 | 0.889 | 0.205 | 0.047 |
| 0.234999999999937 | 0.887 | 0.208 | 0.049 |
| 0.239999999999937 | 0.885 | 0.212 | 0.051 |
| 0.244999999999937 | 0.882 | 0.216 | 0.053 |
| 0.249999999999937 | 0.88 | 0.22 | 0.055 |
| 0.254999999999937 | 0.878 | 0.224 | 0.057 |
| 0.259999999999937 | 0.876 | 0.228 | 0.059 |
| 0.264999999999937 | 0.873 | 0.231 | 0.061 |
| 0.269999999999937 | 0.871 | 0.235 | 0.064 |
| 0.274999999999937 | 0.869 | 0.239 | 0.066 |
| 0.279999999999937 | 0.867 | 0.243 | 0.068 |
| 0.284999999999937 | 0.864 | 0.246 | 0.07 |
| 0.289999999999937 | 0.862 | 0.25 | 0.072 |
| 0.294999999999937 | 0.86 | 0.254 | 0.075 |
| 0.299999999999937 | 0.857 | 0.257 | 0.077 |
| 0.304999999999937 | 0.855 | 0.261 | 0.08 |
| 0.309999999999937 | 0.853 | 0.264 | 0.082 |
| 0.314999999999937 | 0.851 | 0.268 | 0.084 |
| 0.319999999999937 | 0.849 | 0.272 | 0.087 |
| 0.324999999999937 | 0.846 | 0.275 | 0.089 |
| 0.329999999999937 | 0.844 | 0.279 | 0.092 |
| 0.334999999999937 | 0.842 | 0.282 | 0.094 |
| 0.339999999999937 | 0.84 | 0.285 | 0.097 |
| 0.344999999999937 | 0.837 | 0.289 | 0.1 |
| 0.349999999999937 | 0.835 | 0.292 | 0.102 |
| 0.354999999999937 | 0.833 | 0.296 | 0.105 |
| 0.359999999999937 | 0.831 | 0.299 | 0.108 |
| 0.364999999999937 | 0.829 | 0.302 | 0.11 |
| 0.369999999999937 | 0.826 | 0.306 | 0.113 |
| 0.374999999999937 | 0.824 | 0.309 | 0.116 |
| 0.379999999999937 | 0.822 | 0.312 | 0.119 |
| 0.384999999999937 | 0.82 | 0.316 | 0.122 |
| 0.389999999999937 | 0.818 | 0.319 | 0.124 |
| 0.394999999999937 | 0.815 | 0.322 | 0.127 |
| 0.399999999999937 | 0.813 | 0.325 | 0.13 |
| 0.404999999999937 | 0.811 | 0.329 | 0.133 |
| 0.409999999999937 | 0.809 | 0.332 | 0.136 |
| 0.414999999999937 | 0.807 | 0.335 | 0.139 |
| 0.419999999999937 | 0.805 | 0.338 | 0.142 |
| 0.424999999999937 | 0.803 | 0.341 | 0.145 |
| 0.429999999999937 | 0.8 | 0.344 | 0.148 |
| 0.434999999999937 | 0.798 | 0.347 | 0.151 |
| 0.439999999999937 | 0.796 | 0.35 | 0.154 |
| 0.444999999999937 | 0.794 | 0.353 | 0.157 |
| 0.449999999999937 | 0.792 | 0.356 | 0.16 |
| 0.454999999999937 | 0.79 | 0.359 | 0.163 |
| 0.459999999999937 | 0.788 | 0.362 | 0.167 |
| 0.464999999999937 | 0.785 | 0.365 | 0.17 |
| 0.469999999999937 | 0.783 | 0.368 | 0.173 |
| 0.474999999999937 | 0.781 | 0.371 | 0.176 |
| 0.479999999999937 | 0.779 | 0.374 | 0.18 |
| 0.484999999999937 | 0.777 | 0.377 | 0.183 |
| 0.489999999999937 | 0.775 | 0.38 | 0.186 |
| 0.494999999999937 | 0.773 | 0.383 | 0.189 |
| 0.499999999999937 | 0.771 | 0.385 | 0.193 |
| 0.504999999999937 | 0.769 | 0.388 | 0.196 |
| 0.509999999999937 | 0.767 | 0.391 | 0.199 |
| 0.514999999999937 | 0.765 | 0.394 | 0.203 |
| 0.519999999999937 | 0.762 | 0.396 | 0.206 |
| 0.524999999999937 | 0.76 | 0.399 | 0.21 |
| 0.529999999999937 | 0.758 | 0.402 | 0.213 |
| 0.534999999999937 | 0.756 | 0.405 | 0.216 |
| 0.539999999999937 | 0.754 | 0.407 | 0.22 |
| 0.544999999999937 | 0.752 | 0.41 | 0.223 |
| 0.549999999999937 | 0.75 | 0.413 | 0.227 |
| 0.554999999999937 | 0.748 | 0.415 | 0.23 |
| 0.559999999999937 | 0.746 | 0.418 | 0.234 |
| 0.564999999999937 | 0.744 | 0.42 | 0.237 |
| 0.569999999999937 | 0.742 | 0.423 | 0.241 |
| 0.574999999999937 | 0.74 | 0.425 | 0.245 |
| 0.579999999999937 | 0.738 | 0.428 | 0.248 |
| 0.584999999999937 | 0.736 | 0.43 | 0.252 |
| 0.589999999999937 | 0.734 | 0.433 | 0.255 |
| 0.594999999999937 | 0.732 | 0.435 | 0.259 |
| 0.599999999999937 | 0.73 | 0.438 | 0.263 |
| 0.604999999999937 | 0.728 | 0.44 | 0.266 |
| 0.609999999999937 | 0.726 | 0.443 | 0.27 |
| 0.614999999999937 | 0.724 | 0.445 | 0.274 |
| 0.619999999999937 | 0.722 | 0.448 | 0.277 |
| 0.624999999999937 | 0.72 | 0.45 | 0.281 |
| 0.629999999999937 | 0.718 | 0.452 | 0.285 |
| 0.634999999999937 | 0.716 | 0.455 | 0.289 |
| 0.639999999999937 | 0.714 | 0.457 | 0.292 |
| 0.644999999999937 | 0.712 | 0.459 | 0.296 |
| 0.649999999999937 | 0.71 | 0.461 | 0.3 |
| 0.654999999999937 | 0.708 | 0.464 | 0.304 |
| 0.659999999999937 | 0.706 | 0.466 | 0.308 |
| 0.664999999999937 | 0.704 | 0.468 | 0.311 |
| 0.669999999999937 | 0.702 | 0.47 | 0.315 |
| 0.674999999999937 | 0.7 | 0.473 | 0.319 |
| 0.679999999999937 | 0.698 | 0.475 | 0.323 |
| 0.684999999999937 | 0.696 | 0.477 | 0.327 |
| 0.689999999999937 | 0.694 | 0.479 | 0.331 |
| 0.694999999999937 | 0.692 | 0.481 | 0.334 |
| 0.699999999999937 | 0.691 | 0.483 | 0.338 |
| 0.704999999999937 | 0.689 | 0.485 | 0.342 |
| 0.709999999999937 | 0.687 | 0.488 | 0.346 |
| 0.714999999999937 | 0.685 | 0.49 | 0.35 |
| 0.719999999999937 | 0.683 | 0.492 | 0.354 |
| 0.724999999999937 | 0.681 | 0.494 | 0.358 |
| 0.729999999999937 | 0.679 | 0.496 | 0.362 |
| 0.734999999999937 | 0.677 | 0.498 | 0.366 |
| 0.739999999999937 | 0.675 | 0.5 | 0.37 |
| 0.744999999999937 | 0.673 | 0.502 | 0.374 |
| 0.749999999999937 | 0.671 | 0.504 | 0.378 |
| 0.754999999999937 | 0.67 | 0.506 | 0.382 |
| 0.759999999999937 | 0.668 | 0.507 | 0.386 |
| 0.764999999999937 | 0.666 | 0.509 | 0.39 |
| 0.769999999999937 | 0.664 | 0.511 | 0.394 |
| 0.774999999999937 | 0.662 | 0.513 | 0.398 |
| 0.779999999999937 | 0.66 | 0.515 | 0.402 |
| 0.784999999999937 | 0.658 | 0.517 | 0.406 |
| 0.789999999999937 | 0.656 | 0.519 | 0.41 |
| 0.794999999999937 | 0.655 | 0.52 | 0.414 |
| 0.799999999999937 | 0.653 | 0.522 | 0.418 |
| 0.804999999999937 | 0.651 | 0.524 | 0.422 |
| 0.809999999999937 | 0.649 | 0.526 | 0.426 |
| 0.814999999999937 | 0.647 | 0.528 | 0.43 |
| 0.819999999999937 | 0.645 | 0.529 | 0.434 |
| 0.824999999999937 | 0.644 | 0.531 | 0.438 |
| 0.829999999999937 | 0.642 | 0.533 | 0.442 |
| 0.834999999999937 | 0.64 | 0.534 | 0.446 |
| 0.839999999999937 | 0.638 | 0.536 | 0.45 |
| 0.844999999999937 | 0.636 | 0.538 | 0.454 |
| 0.849999999999937 | 0.634 | 0.539 | 0.458 |
| 0.854999999999937 | 0.633 | 0.541 | 0.463 |
| 0.859999999999937 | 0.631 | 0.543 | 0.467 |
| 0.864999999999937 | 0.629 | 0.544 | 0.471 |
| 0.869999999999937 | 0.627 | 0.546 | 0.475 |
| 0.874999999999937 | 0.626 | 0.547 | 0.479 |
| 0.879999999999937 | 0.624 | 0.549 | 0.483 |
| 0.884999999999937 | 0.622 | 0.55 | 0.487 |
| 0.889999999999937 | 0.62 | 0.552 | 0.491 |
| 0.894999999999937 | 0.618 | 0.553 | 0.495 |
| 0.899999999999937 | 0.617 | 0.555 | 0.499 |
| 0.904999999999937 | 0.615 | 0.556 | 0.504 |
| 0.909999999999938 | 0.613 | 0.558 | 0.508 |
| 0.914999999999938 | 0.611 | 0.559 | 0.512 |
| 0.919999999999938 | 0.61 | 0.561 | 0.516 |
| 0.924999999999938 | 0.608 | 0.562 | 0.52 |
| 0.929999999999938 | 0.606 | 0.564 | 0.524 |
| 0.934999999999938 | 0.604 | 0.565 | 0.528 |
| 0.939999999999938 | 0.603 | 0.566 | 0.532 |
| 0.944999999999938 | 0.601 | 0.568 | 0.537 |
| 0.949999999999938 | 0.599 | 0.569 | 0.541 |
| 0.954999999999938 | 0.597 | 0.57 | 0.545 |
| 0.959999999999938 | 0.596 | 0.572 | 0.549 |
| 0.964999999999938 | 0.594 | 0.573 | 0.553 |
| 0.969999999999938 | 0.592 | 0.574 | 0.557 |
| 0.974999999999938 | 0.59 | 0.576 | 0.561 |
| 0.979999999999938 | 0.589 | 0.577 | 0.565 |
| 0.984999999999938 | 0.587 | 0.578 | 0.57 |
| 0.989999999999938 | 0.585 | 0.58 | 0.574 |
| 0.994999999999938 | 0.584 | 0.581 | 0.578 |
| 0.999999999999938 | 0.582 | 0.582 | 0.582 |
| 1.004999999999937 | 0.58 | 0.583 | 0.586 |
| 1.009999999999937 | 0.579 | 0.584 | 0.59 |
| 1.014999999999937 | 0.577 | 0.586 | 0.594 |
| 1.019999999999937 | 0.575 | 0.587 | 0.598 |
| 1.024999999999937 | 0.574 | 0.588 | 0.603 |
| 1.029999999999937 | 0.572 | 0.589 | 0.607 |
| 1.034999999999937 | 0.57 | 0.59 | 0.611 |
| 1.039999999999937 | 0.569 | 0.591 | 0.615 |
| 1.044999999999937 | 0.567 | 0.592 | 0.619 |
| 1.049999999999937 | 0.565 | 0.593 | 0.623 |
| 1.054999999999936 | 0.564 | 0.595 | 0.627 |
| 1.059999999999936 | 0.562 | 0.596 | 0.631 |
| 1.064999999999936 | 0.56 | 0.597 | 0.635 |
| 1.069999999999936 | 0.559 | 0.598 | 0.64 |
| 1.074999999999936 | 0.557 | 0.599 | 0.644 |
| 1.079999999999936 | 0.555 | 0.6 | 0.648 |
| 1.084999999999936 | 0.554 | 0.601 | 0.652 |
| 1.089999999999936 | 0.552 | 0.602 | 0.656 |
| 1.094999999999936 | 0.55 | 0.603 | 0.66 |
| 1.099999999999935 | 0.549 | 0.604 | 0.664 |
| 1.104999999999935 | 0.547 | 0.605 | 0.668 |
| 1.109999999999935 | 0.546 | 0.606 | 0.672 |
| 1.114999999999935 | 0.544 | 0.607 | 0.676 |
| 1.119999999999935 | 0.542 | 0.608 | 0.68 |
| 1.124999999999935 | 0.541 | 0.608 | 0.684 |
| 1.129999999999935 | 0.539 | 0.609 | 0.689 |
| 1.134999999999935 | 0.538 | 0.61 | 0.693 |
| 1.139999999999935 | 0.536 | 0.611 | 0.697 |
| 1.144999999999934 | 0.534 | 0.612 | 0.701 |
| 1.149999999999934 | 0.533 | 0.613 | 0.705 |
| 1.154999999999934 | 0.531 | 0.614 | 0.709 |
| 1.159999999999934 | 0.53 | 0.614 | 0.713 |
| 1.164999999999934 | 0.528 | 0.615 | 0.717 |
| 1.169999999999934 | 0.527 | 0.616 | 0.721 |
| 1.174999999999934 | 0.525 | 0.617 | 0.725 |
| 1.179999999999934 | 0.523 | 0.618 | 0.729 |
| 1.184999999999934 | 0.522 | 0.618 | 0.733 |
| 1.189999999999934 | 0.52 | 0.619 | 0.737 |
| 1.194999999999933 | 0.519 | 0.62 | 0.741 |
| 1.199999999999933 | 0.517 | 0.621 | 0.745 |
| 1.204999999999933 | 0.516 | 0.621 | 0.749 |
| 1.209999999999933 | 0.514 | 0.622 | 0.753 |
| 1.214999999999933 | 0.513 | 0.623 | 0.757 |
| 1.219999999999933 | 0.511 | 0.623 | 0.761 |
| 1.224999999999933 | 0.51 | 0.624 | 0.765 |
| 1.229999999999933 | 0.508 | 0.625 | 0.769 |
| 1.234999999999933 | 0.506 | 0.626 | 0.773 |
| 1.239999999999932 | 0.505 | 0.626 | 0.776 |
| 1.244999999999932 | 0.503 | 0.627 | 0.78 |
| 1.249999999999932 | 0.502 | 0.627 | 0.784 |
| 1.254999999999932 | 0.5 | 0.628 | 0.788 |
| 1.259999999999932 | 0.499 | 0.629 | 0.792 |
| 1.264999999999932 | 0.497 | 0.629 | 0.796 |
| 1.269999999999932 | 0.496 | 0.63 | 0.8 |
| 1.274999999999932 | 0.494 | 0.63 | 0.804 |
| 1.279999999999932 | 0.493 | 0.631 | 0.808 |
| 1.284999999999932 | 0.491 | 0.632 | 0.812 |
| 1.289999999999931 | 0.49 | 0.632 | 0.815 |
| 1.294999999999931 | 0.488 | 0.633 | 0.819 |
| 1.299999999999931 | 0.487 | 0.633 | 0.823 |
| 1.304999999999931 | 0.486 | 0.634 | 0.827 |
| 1.309999999999931 | 0.484 | 0.634 | 0.831 |
| 1.314999999999931 | 0.483 | 0.635 | 0.835 |
| 1.319999999999931 | 0.481 | 0.635 | 0.838 |
| 1.324999999999931 | 0.48 | 0.636 | 0.842 |
| 1.329999999999931 | 0.478 | 0.636 | 0.846 |
| 1.33499999999993 | 0.477 | 0.637 | 0.85 |
| 1.33999999999993 | 0.475 | 0.637 | 0.854 |
| 1.34499999999993 | 0.474 | 0.637 | 0.857 |
| 1.34999999999993 | 0.472 | 0.638 | 0.861 |
| 1.35499999999993 | 0.471 | 0.638 | 0.865 |
| 1.35999999999993 | 0.47 | 0.639 | 0.869 |
| 1.36499999999993 | 0.468 | 0.639 | 0.872 |
| 1.36999999999993 | 0.467 | 0.639 | 0.876 |
| 1.37499999999993 | 0.465 | 0.64 | 0.88 |
| 1.379999999999929 | 0.464 | 0.64 | 0.883 |
| 1.384999999999929 | 0.462 | 0.641 | 0.887 |
| 1.389999999999929 | 0.461 | 0.641 | 0.891 |
| 1.394999999999929 | 0.46 | 0.641 | 0.894 |
| 1.399999999999929 | 0.458 | 0.642 | 0.898 |
| 1.404999999999929 | 0.457 | 0.642 | 0.902 |
| 1.409999999999929 | 0.455 | 0.642 | 0.905 |
| 1.414999999999929 | 0.454 | 0.642 | 0.909 |
| 1.419999999999929 | 0.453 | 0.643 | 0.913 |
| 1.424999999999929 | 0.451 | 0.643 | 0.916 |
| 1.429999999999928 | 0.45 | 0.643 | 0.92 |
| 1.434999999999928 | 0.448 | 0.644 | 0.924 |
| 1.439999999999928 | 0.447 | 0.644 | 0.927 |
| 1.444999999999928 | 0.446 | 0.644 | 0.931 |
| 1.449999999999928 | 0.444 | 0.644 | 0.934 |
| 1.454999999999928 | 0.443 | 0.645 | 0.938 |
| 1.459999999999928 | 0.442 | 0.645 | 0.941 |
| 1.464999999999928 | 0.44 | 0.645 | 0.945 |
| 1.469999999999928 | 0.439 | 0.645 | 0.948 |
| 1.474999999999927 | 0.438 | 0.645 | 0.952 |
| 1.479999999999927 | 0.436 | 0.646 | 0.955 |
| 1.484999999999927 | 0.435 | 0.646 | 0.959 |
| 1.489999999999927 | 0.434 | 0.646 | 0.962 |
| 1.494999999999927 | 0.432 | 0.646 | 0.966 |
| 1.499999999999927 | 0.431 | 0.646 | 0.969 |
| 1.504999999999927 | 0.429 | 0.646 | 0.973 |
| 1.509999999999927 | 0.428 | 0.647 | 0.976 |
| 1.514999999999927 | 0.427 | 0.647 | 0.98 |
| 1.519999999999927 | 0.426 | 0.647 | 0.983 |
| 1.524999999999926 | 0.424 | 0.647 | 0.986 |
| 1.529999999999926 | 0.423 | 0.647 | 0.99 |
| 1.534999999999926 | 0.422 | 0.647 | 0.993 |
| 1.539999999999926 | 0.42 | 0.647 | 0.997 |
| 1.544999999999926 | 0.419 | 0.647 | 1 |
| 1.549999999999926 | 0.418 | 0.647 | 1.003 |
| 1.554999999999926 | 0.416 | 0.647 | 1.007 |
| 1.559999999999926 | 0.415 | 0.647 | 1.01 |
| 1.564999999999926 | 0.414 | 0.647 | 1.013 |
| 1.569999999999925 | 0.412 | 0.648 | 1.017 |
| 1.574999999999925 | 0.411 | 0.648 | 1.02 |
| 1.579999999999925 | 0.41 | 0.648 | 1.023 |
| 1.584999999999925 | 0.409 | 0.648 | 1.026 |
| 1.589999999999925 | 0.407 | 0.648 | 1.03 |
| 1.594999999999925 | 0.406 | 0.648 | 1.033 |
| 1.599999999999925 | 0.405 | 0.648 | 1.036 |
| 1.604999999999925 | 0.403 | 0.648 | 1.039 |
| 1.609999999999925 | 0.402 | 0.648 | 1.043 |
| 1.614999999999924 | 0.401 | 0.648 | 1.046 |
| 1.619999999999924 | 0.4 | 0.648 | 1.049 |
| 1.624999999999924 | 0.398 | 0.647 | 1.052 |
| 1.629999999999924 | 0.397 | 0.647 | 1.055 |
| 1.634999999999924 | 0.396 | 0.647 | 1.058 |
| 1.639999999999924 | 0.395 | 0.647 | 1.062 |
| 1.644999999999924 | 0.393 | 0.647 | 1.065 |
| 1.649999999999924 | 0.392 | 0.647 | 1.068 |
| 1.654999999999924 | 0.391 | 0.647 | 1.071 |
| 1.659999999999923 | 0.39 | 0.647 | 1.074 |
| 1.664999999999923 | 0.389 | 0.647 | 1.077 |
| 1.669999999999923 | 0.387 | 0.647 | 1.08 |
| 1.674999999999923 | 0.386 | 0.647 | 1.083 |
| 1.679999999999923 | 0.385 | 0.647 | 1.086 |
| 1.684999999999923 | 0.384 | 0.646 | 1.089 |
| 1.689999999999923 | 0.382 | 0.646 | 1.092 |
| 1.694999999999923 | 0.381 | 0.646 | 1.095 |
| 1.699999999999923 | 0.38 | 0.646 | 1.098 |
| 1.704999999999923 | 0.379 | 0.646 | 1.101 |
| 1.709999999999922 | 0.378 | 0.646 | 1.104 |
| 1.714999999999922 | 0.376 | 0.645 | 1.107 |
| 1.719999999999922 | 0.375 | 0.645 | 1.11 |
| 1.724999999999922 | 0.374 | 0.645 | 1.113 |
| 1.729999999999922 | 0.373 | 0.645 | 1.116 |
| 1.734999999999922 | 0.372 | 0.645 | 1.119 |
| 1.739999999999922 | 0.37 | 0.645 | 1.121 |
| 1.744999999999922 | 0.369 | 0.644 | 1.124 |
| 1.749999999999922 | 0.368 | 0.644 | 1.127 |
| 1.754999999999921 | 0.367 | 0.644 | 1.13 |
| 1.759999999999921 | 0.366 | 0.644 | 1.133 |
| 1.764999999999921 | 0.365 | 0.643 | 1.136 |
| 1.769999999999921 | 0.363 | 0.643 | 1.138 |
| 1.774999999999921 | 0.362 | 0.643 | 1.141 |
| 1.779999999999921 | 0.361 | 0.643 | 1.144 |
| 1.784999999999921 | 0.36 | 0.642 | 1.147 |
| 1.789999999999921 | 0.359 | 0.642 | 1.149 |
| 1.794999999999921 | 0.358 | 0.642 | 1.152 |
| 1.79999999999992 | 0.356 | 0.642 | 1.155 |
| 1.80499999999992 | 0.355 | 0.641 | 1.158 |
| 1.80999999999992 | 0.354 | 0.641 | 1.16 |
| 1.81499999999992 | 0.353 | 0.641 | 1.163 |
| 1.81999999999992 | 0.352 | 0.64 | 1.166 |
| 1.82499999999992 | 0.351 | 0.64 | 1.168 |
| 1.82999999999992 | 0.35 | 0.64 | 1.171 |
| 1.83499999999992 | 0.349 | 0.64 | 1.174 |
| 1.83999999999992 | 0.347 | 0.639 | 1.176 |
| 1.84499999999992 | 0.346 | 0.639 | 1.179 |
| 1.849999999999919 | 0.345 | 0.639 | 1.181 |
| 1.854999999999919 | 0.344 | 0.638 | 1.184 |
| 1.859999999999919 | 0.343 | 0.638 | 1.186 |
| 1.864999999999919 | 0.342 | 0.638 | 1.189 |
| 1.869999999999919 | 0.341 | 0.637 | 1.191 |
| 1.874999999999919 | 0.34 | 0.637 | 1.194 |
| 1.879999999999919 | 0.339 | 0.636 | 1.196 |
| 1.884999999999919 | 0.337 | 0.636 | 1.199 |
| 1.889999999999919 | 0.336 | 0.636 | 1.201 |
| 1.894999999999918 | 0.335 | 0.635 | 1.204 |
| 1.899999999999918 | 0.334 | 0.635 | 1.206 |
| 1.904999999999918 | 0.333 | 0.635 | 1.209 |
| 1.909999999999918 | 0.332 | 0.634 | 1.211 |
| 1.914999999999918 | 0.331 | 0.634 | 1.214 |
| 1.919999999999918 | 0.33 | 0.633 | 1.216 |
| 1.924999999999918 | 0.329 | 0.633 | 1.218 |
| 1.929999999999918 | 0.328 | 0.632 | 1.221 |
| 1.934999999999918 | 0.327 | 0.632 | 1.223 |
| 1.939999999999918 | 0.326 | 0.632 | 1.225 |
| 1.944999999999917 | 0.325 | 0.631 | 1.228 |
| 1.949999999999917 | 0.323 | 0.631 | 1.23 |
| 1.954999999999917 | 0.322 | 0.63 | 1.232 |
| 1.959999999999917 | 0.321 | 0.63 | 1.234 |
| 1.964999999999917 | 0.32 | 0.629 | 1.237 |
| 1.969999999999917 | 0.319 | 0.629 | 1.239 |
| 1.974999999999917 | 0.318 | 0.628 | 1.241 |
| 1.979999999999917 | 0.317 | 0.628 | 1.243 |
| 1.984999999999917 | 0.316 | 0.628 | 1.246 |
| 1.989999999999916 | 0.315 | 0.627 | 1.248 |
| 1.994999999999916 | 0.314 | 0.627 | 1.25 |
| 1.999999999999916 | 0.313 | 0.626 | 1.252 |
| 2.004999999999916 | 0.312 | 0.626 | 1.254 |
| 2.009999999999916 | 0.311 | 0.625 | 1.256 |
| 2.014999999999916 | 0.31 | 0.625 | 1.259 |
| 2.019999999999916 | 0.309 | 0.624 | 1.261 |
| 2.024999999999916 | 0.308 | 0.624 | 1.263 |
| 2.029999999999916 | 0.307 | 0.623 | 1.265 |
| 2.034999999999916 | 0.306 | 0.623 | 1.267 |
| 2.039999999999916 | 0.305 | 0.622 | 1.269 |
| 2.044999999999916 | 0.304 | 0.621 | 1.271 |
| 2.049999999999915 | 0.303 | 0.621 | 1.273 |
| 2.054999999999915 | 0.302 | 0.62 | 1.275 |
| 2.059999999999915 | 0.301 | 0.62 | 1.277 |
| 2.064999999999915 | 0.3 | 0.619 | 1.279 |
| 2.069999999999915 | 0.299 | 0.619 | 1.281 |
| 2.074999999999915 | 0.298 | 0.618 | 1.283 |
| 2.079999999999915 | 0.297 | 0.618 | 1.285 |
| 2.084999999999915 | 0.296 | 0.617 | 1.287 |
| 2.089999999999915 | 0.295 | 0.617 | 1.289 |
| 2.094999999999914 | 0.294 | 0.616 | 1.29 |
| 2.099999999999914 | 0.293 | 0.615 | 1.292 |
| 2.104999999999914 | 0.292 | 0.615 | 1.294 |
| 2.109999999999914 | 0.291 | 0.614 | 1.296 |
| 2.114999999999914 | 0.29 | 0.614 | 1.298 |
| 2.119999999999914 | 0.289 | 0.613 | 1.3 |
| 2.124999999999914 | 0.288 | 0.612 | 1.301 |
| 2.129999999999914 | 0.287 | 0.612 | 1.303 |
| 2.134999999999914 | 0.286 | 0.611 | 1.305 |
| 2.139999999999914 | 0.285 | 0.611 | 1.307 |
| 2.144999999999913 | 0.284 | 0.61 | 1.309 |
| 2.149999999999913 | 0.283 | 0.609 | 1.31 |
| 2.154999999999913 | 0.283 | 0.609 | 1.312 |
| 2.159999999999913 | 0.282 | 0.608 | 1.314 |
| 2.164999999999913 | 0.281 | 0.608 | 1.315 |
| 2.169999999999913 | 0.28 | 0.607 | 1.317 |
| 2.174999999999913 | 0.279 | 0.606 | 1.319 |
| 2.179999999999913 | 0.278 | 0.606 | 1.32 |
| 2.184999999999912 | 0.277 | 0.605 | 1.322 |
| 2.189999999999912 | 0.276 | 0.604 | 1.324 |
| 2.194999999999912 | 0.275 | 0.604 | 1.325 |
| 2.199999999999912 | 0.274 | 0.603 | 1.327 |
| 2.204999999999912 | 0.273 | 0.602 | 1.328 |
| 2.209999999999912 | 0.272 | 0.602 | 1.33 |
| 2.214999999999912 | 0.271 | 0.601 | 1.332 |
| 2.219999999999912 | 0.27 | 0.6 | 1.333 |
| 2.224999999999912 | 0.27 | 0.6 | 1.335 |
| 2.229999999999912 | 0.269 | 0.599 | 1.336 |
| 2.234999999999911 | 0.268 | 0.598 | 1.338 |
| 2.239999999999911 | 0.267 | 0.598 | 1.339 |
| 2.244999999999911 | 0.266 | 0.597 | 1.341 |
| 2.249999999999911 | 0.265 | 0.596 | 1.342 |
| 2.254999999999911 | 0.264 | 0.596 | 1.343 |
| 2.259999999999911 | 0.263 | 0.595 | 1.345 |
| 2.264999999999911 | 0.262 | 0.594 | 1.346 |
| 2.269999999999911 | 0.262 | 0.594 | 1.348 |
| 2.274999999999911 | 0.261 | 0.593 | 1.349 |
| 2.279999999999911 | 0.26 | 0.592 | 1.35 |
| 2.28499999999991 | 0.259 | 0.592 | 1.352 |
| 2.28999999999991 | 0.258 | 0.591 | 1.353 |
| 2.29499999999991 | 0.257 | 0.59 | 1.354 |
| 2.29999999999991 | 0.256 | 0.589 | 1.356 |
| 2.30499999999991 | 0.255 | 0.589 | 1.357 |
| 2.30999999999991 | 0.255 | 0.588 | 1.358 |
| 2.31499999999991 | 0.254 | 0.587 | 1.36 |
| 2.31999999999991 | 0.253 | 0.587 | 1.361 |
| 2.32499999999991 | 0.252 | 0.586 | 1.362 |
| 2.329999999999909 | 0.251 | 0.585 | 1.363 |
| 2.334999999999909 | 0.25 | 0.584 | 1.365 |
| 2.339999999999909 | 0.249 | 0.584 | 1.366 |
| 2.344999999999909 | 0.249 | 0.583 | 1.367 |
| 2.349999999999909 | 0.248 | 0.582 | 1.368 |
| 2.354999999999909 | 0.247 | 0.581 | 1.369 |
| 2.359999999999909 | 0.246 | 0.581 | 1.37 |
| 2.364999999999909 | 0.245 | 0.58 | 1.372 |
| 2.369999999999909 | 0.244 | 0.579 | 1.373 |
| 2.374999999999908 | 0.244 | 0.578 | 1.374 |
| 2.379999999999908 | 0.243 | 0.578 | 1.375 |
| 2.384999999999908 | 0.242 | 0.577 | 1.376 |
| 2.389999999999908 | 0.241 | 0.576 | 1.377 |
| 2.394999999999908 | 0.24 | 0.575 | 1.378 |
| 2.399999999999908 | 0.239 | 0.575 | 1.379 |
| 2.404999999999908 | 0.239 | 0.574 | 1.38 |
| 2.409999999999908 | 0.238 | 0.573 | 1.381 |
| 2.414999999999908 | 0.237 | 0.572 | 1.382 |
| 2.419999999999908 | 0.236 | 0.572 | 1.383 |
| 2.424999999999907 | 0.235 | 0.571 | 1.384 |
| 2.429999999999907 | 0.235 | 0.57 | 1.385 |
| 2.434999999999907 | 0.234 | 0.569 | 1.386 |
| 2.439999999999907 | 0.233 | 0.568 | 1.387 |
| 2.444999999999907 | 0.232 | 0.568 | 1.388 |
| 2.449999999999907 | 0.231 | 0.567 | 1.389 |
| 2.454999999999907 | 0.231 | 0.566 | 1.39 |
| 2.459999999999907 | 0.23 | 0.565 | 1.391 |
| 2.464999999999907 | 0.229 | 0.565 | 1.392 |
| 2.469999999999906 | 0.228 | 0.564 | 1.392 |
| 2.474999999999906 | 0.227 | 0.563 | 1.393 |
| 2.479999999999906 | 0.227 | 0.562 | 1.394 |
| 2.484999999999906 | 0.226 | 0.561 | 1.395 |
| 2.489999999999906 | 0.225 | 0.561 | 1.396 |
| 2.494999999999906 | 0.224 | 0.56 | 1.396 |
| 2.499999999999906 | 0.224 | 0.559 | 1.397 |
| 2.504999999999906 | 0.223 | 0.558 | 1.398 |
| 2.509999999999906 | 0.222 | 0.557 | 1.399 |
| 2.514999999999906 | 0.221 | 0.556 | 1.4 |
| 2.519999999999905 | 0.22 | 0.556 | 1.4 |
| 2.524999999999905 | 0.22 | 0.555 | 1.401 |
| 2.529999999999905 | 0.219 | 0.554 | 1.402 |
| 2.534999999999905 | 0.218 | 0.553 | 1.402 |
| 2.539999999999905 | 0.217 | 0.552 | 1.403 |
| 2.544999999999905 | 0.217 | 0.552 | 1.404 |
| 2.549999999999905 | 0.216 | 0.551 | 1.404 |
| 2.554999999999905 | 0.215 | 0.55 | 1.405 |
| 2.559999999999905 | 0.214 | 0.549 | 1.406 |
| 2.564999999999904 | 0.214 | 0.548 | 1.406 |
| 2.569999999999904 | 0.213 | 0.547 | 1.407 |
| 2.574999999999904 | 0.212 | 0.547 | 1.407 |
| 2.579999999999904 | 0.212 | 0.546 | 1.408 |
| 2.584999999999904 | 0.211 | 0.545 | 1.409 |
| 2.589999999999904 | 0.21 | 0.544 | 1.409 |
| 2.594999999999904 | 0.209 | 0.543 | 1.41 |
| 2.599999999999904 | 0.209 | 0.542 | 1.41 |
| 2.604999999999904 | 0.208 | 0.542 | 1.411 |
| 2.609999999999903 | 0.207 | 0.541 | 1.411 |
| 2.614999999999903 | 0.206 | 0.54 | 1.412 |
| 2.619999999999903 | 0.206 | 0.539 | 1.412 |
| 2.624999999999903 | 0.205 | 0.538 | 1.413 |
| 2.629999999999903 | 0.204 | 0.537 | 1.413 |
| 2.634999999999903 | 0.204 | 0.536 | 1.414 |
| 2.639999999999903 | 0.203 | 0.536 | 1.414 |
| 2.644999999999903 | 0.202 | 0.535 | 1.414 |
| 2.649999999999903 | 0.201 | 0.534 | 1.415 |
| 2.654999999999902 | 0.201 | 0.533 | 1.415 |
| 2.659999999999902 | 0.2 | 0.532 | 1.416 |
| 2.664999999999902 | 0.199 | 0.531 | 1.416 |
| 2.669999999999902 | 0.199 | 0.53 | 1.416 |
| 2.674999999999902 | 0.198 | 0.53 | 1.417 |
| 2.679999999999902 | 0.197 | 0.529 | 1.417 |
| 2.684999999999902 | 0.197 | 0.528 | 1.417 |
| 2.689999999999902 | 0.196 | 0.527 | 1.418 |
| 2.694999999999902 | 0.195 | 0.526 | 1.418 |
| 2.699999999999901 | 0.195 | 0.525 | 1.418 |
| 2.704999999999901 | 0.194 | 0.524 | 1.418 |
| 2.709999999999901 | 0.193 | 0.523 | 1.419 |
| 2.714999999999901 | 0.192 | 0.523 | 1.419 |
| 2.719999999999901 | 0.192 | 0.522 | 1.419 |
| 2.724999999999901 | 0.191 | 0.521 | 1.419 |
| 2.729999999999901 | 0.19 | 0.52 | 1.42 |
| 2.734999999999901 | 0.19 | 0.519 | 1.42 |
| 2.739999999999901 | 0.189 | 0.518 | 1.42 |
| 2.744999999999901 | 0.188 | 0.517 | 1.42 |
| 2.7499999999999 | 0.188 | 0.516 | 1.42 |
| 2.7549999999999 | 0.187 | 0.516 | 1.42 |
| 2.7599999999999 | 0.186 | 0.515 | 1.421 |
| 2.7649999999999 | 0.186 | 0.514 | 1.421 |
| 2.7699999999999 | 0.185 | 0.513 | 1.421 |
| 2.7749999999999 | 0.185 | 0.512 | 1.421 |
| 2.7799999999999 | 0.184 | 0.511 | 1.421 |
| 2.7849999999999 | 0.183 | 0.51 | 1.421 |
| 2.7899999999999 | 0.183 | 0.509 | 1.421 |
| 2.794999999999899 | 0.182 | 0.509 | 1.421 |
| 2.799999999999899 | 0.181 | 0.508 | 1.421 |
| 2.804999999999899 | 0.181 | 0.507 | 1.421 |
| 2.809999999999899 | 0.18 | 0.506 | 1.421 |
| 2.814999999999899 | 0.179 | 0.505 | 1.421 |
| 2.819999999999899 | 0.179 | 0.504 | 1.421 |
| 2.824999999999899 | 0.178 | 0.503 | 1.421 |
| 2.829999999999899 | 0.177 | 0.502 | 1.421 |
| 2.834999999999899 | 0.177 | 0.501 | 1.421 |
| 2.839999999999899 | 0.176 | 0.5 | 1.421 |
| 2.844999999999898 | 0.176 | 0.5 | 1.421 |
| 2.849999999999898 | 0.175 | 0.499 | 1.421 |
| 2.854999999999898 | 0.174 | 0.498 | 1.421 |
| 2.859999999999898 | 0.174 | 0.497 | 1.421 |
| 2.864999999999898 | 0.173 | 0.496 | 1.421 |
| 2.869999999999898 | 0.173 | 0.495 | 1.421 |
| 2.874999999999898 | 0.172 | 0.494 | 1.421 |
| 2.879999999999898 | 0.171 | 0.493 | 1.421 |
| 2.884999999999898 | 0.171 | 0.492 | 1.421 |
| 2.889999999999897 | 0.17 | 0.491 | 1.42 |
| 2.894999999999897 | 0.169 | 0.491 | 1.42 |
| 2.899999999999897 | 0.169 | 0.49 | 1.42 |
| 2.904999999999897 | 0.168 | 0.489 | 1.42 |
| 2.909999999999897 | 0.168 | 0.488 | 1.42 |
| 2.914999999999897 | 0.167 | 0.487 | 1.42 |
| 2.919999999999897 | 0.166 | 0.486 | 1.419 |
| 2.924999999999897 | 0.166 | 0.485 | 1.419 |
| 2.929999999999897 | 0.165 | 0.484 | 1.419 |
| 2.934999999999897 | 0.165 | 0.483 | 1.419 |
| 2.939999999999896 | 0.164 | 0.482 | 1.418 |
| 2.944999999999896 | 0.164 | 0.482 | 1.418 |
| 2.949999999999896 | 0.163 | 0.481 | 1.418 |
| 2.954999999999896 | 0.162 | 0.48 | 1.418 |
| 2.959999999999896 | 0.162 | 0.479 | 1.417 |
| 2.964999999999896 | 0.161 | 0.478 | 1.417 |
| 2.969999999999896 | 0.161 | 0.477 | 1.417 |
| 2.974999999999896 | 0.16 | 0.476 | 1.416 |
| 2.979999999999896 | 0.159 | 0.475 | 1.416 |
| 2.984999999999895 | 0.159 | 0.474 | 1.416 |
| 2.989999999999895 | 0.158 | 0.473 | 1.415 |
| 2.994999999999895 | 0.158 | 0.472 | 1.415 |
| 2.999999999999895 | 0.157 | 0.472 | 1.415 |
| 3.004999999999895 | 0.157 | 0.471 | 1.414 |
| 3.009999999999895 | 0.156 | 0.47 | 1.414 |
| 3.014999999999895 | 0.155 | 0.469 | 1.414 |
| 3.019999999999895 | 0.155 | 0.468 | 1.413 |
| 3.024999999999895 | 0.154 | 0.467 | 1.413 |
| 3.029999999999895 | 0.154 | 0.466 | 1.412 |
| 3.034999999999894 | 0.153 | 0.465 | 1.412 |
| 3.039999999999894 | 0.153 | 0.464 | 1.411 |
| 3.044999999999894 | 0.152 | 0.463 | 1.411 |
| 3.049999999999894 | 0.152 | 0.462 | 1.41 |
| 3.054999999999894 | 0.151 | 0.462 | 1.41 |
| 3.059999999999894 | 0.151 | 0.461 | 1.41 |
| 3.064999999999894 | 0.15 | 0.46 | 1.409 |
| 3.069999999999894 | 0.149 | 0.459 | 1.409 |
| 3.074999999999894 | 0.149 | 0.458 | 1.408 |
| 3.079999999999893 | 0.148 | 0.457 | 1.408 |
| 3.084999999999893 | 0.148 | 0.456 | 1.407 |
| 3.089999999999893 | 0.147 | 0.455 | 1.406 |
| 3.094999999999893 | 0.147 | 0.454 | 1.406 |
| 3.099999999999893 | 0.146 | 0.453 | 1.405 |
| 3.104999999999893 | 0.146 | 0.452 | 1.405 |
| 3.109999999999893 | 0.145 | 0.452 | 1.404 |
| 3.114999999999893 | 0.145 | 0.451 | 1.404 |
| 3.119999999999893 | 0.144 | 0.45 | 1.403 |
| 3.124999999999893 | 0.144 | 0.449 | 1.402 |
| 3.129999999999892 | 0.143 | 0.448 | 1.402 |
| 3.134999999999892 | 0.143 | 0.447 | 1.401 |
| 3.139999999999892 | 0.142 | 0.446 | 1.401 |
| 3.144999999999892 | 0.142 | 0.445 | 1.4 |
| 3.149999999999892 | 0.141 | 0.444 | 1.399 |
| 3.154999999999892 | 0.141 | 0.443 | 1.399 |
| 3.159999999999892 | 0.14 | 0.442 | 1.398 |
| 3.164999999999892 | 0.139 | 0.442 | 1.397 |
| 3.169999999999892 | 0.139 | 0.441 | 1.397 |
| 3.174999999999891 | 0.138 | 0.44 | 1.396 |
| 3.179999999999891 | 0.138 | 0.439 | 1.395 |
| 3.184999999999891 | 0.137 | 0.438 | 1.395 |
| 3.189999999999891 | 0.137 | 0.437 | 1.394 |
| 3.194999999999891 | 0.136 | 0.436 | 1.393 |
| 3.199999999999891 | 0.136 | 0.435 | 1.392 |
| 3.204999999999891 | 0.135 | 0.434 | 1.392 |
| 3.209999999999891 | 0.135 | 0.433 | 1.391 |
| 3.214999999999891 | 0.135 | 0.432 | 1.39 |
| 3.21999999999989 | 0.134 | 0.432 | 1.389 |
| 3.22499999999989 | 0.134 | 0.431 | 1.389 |
| 3.22999999999989 | 0.133 | 0.43 | 1.388 |
| 3.23499999999989 | 0.133 | 0.429 | 1.387 |
| 3.23999999999989 | 0.132 | 0.428 | 1.386 |
| 3.24499999999989 | 0.132 | 0.427 | 1.386 |
| 3.24999999999989 | 0.131 | 0.426 | 1.385 |
| 3.25499999999989 | 0.131 | 0.425 | 1.384 |
| 3.25999999999989 | 0.13 | 0.424 | 1.383 |
| 3.26499999999989 | 0.13 | 0.423 | 1.382 |
| 3.269999999999889 | 0.129 | 0.422 | 1.381 |
| 3.274999999999889 | 0.129 | 0.422 | 1.381 |
| 3.279999999999889 | 0.128 | 0.421 | 1.38 |
| 3.284999999999889 | 0.128 | 0.42 | 1.379 |
| 3.289999999999889 | 0.127 | 0.419 | 1.378 |
| 3.294999999999889 | 0.127 | 0.418 | 1.377 |
| 3.299999999999889 | 0.126 | 0.417 | 1.376 |
| 3.304999999999889 | 0.126 | 0.416 | 1.375 |
| 3.309999999999889 | 0.125 | 0.415 | 1.374 |
| 3.314999999999888 | 0.125 | 0.414 | 1.374 |
| 3.319999999999888 | 0.125 | 0.413 | 1.373 |
| 3.324999999999888 | 0.124 | 0.413 | 1.372 |
| 3.329999999999888 | 0.124 | 0.412 | 1.371 |
| 3.334999999999888 | 0.123 | 0.411 | 1.37 |
| 3.339999999999888 | 0.123 | 0.41 | 1.369 |
| 3.344999999999888 | 0.122 | 0.409 | 1.368 |
| 3.349999999999888 | 0.122 | 0.408 | 1.367 |
| 3.354999999999888 | 0.121 | 0.407 | 1.366 |
| 3.359999999999887 | 0.121 | 0.406 | 1.365 |
| 3.364999999999887 | 0.12 | 0.405 | 1.364 |
| 3.369999999999887 | 0.12 | 0.404 | 1.363 |
| 3.374999999999887 | 0.12 | 0.404 | 1.362 |
| 3.379999999999887 | 0.119 | 0.403 | 1.361 |
| 3.384999999999887 | 0.119 | 0.402 | 1.36 |
| 3.389999999999887 | 0.118 | 0.401 | 1.359 |
| 3.394999999999887 | 0.118 | 0.4 | 1.358 |
| 3.399999999999887 | 0.117 | 0.399 | 1.357 |
| 3.404999999999887 | 0.117 | 0.398 | 1.356 |
| 3.409999999999886 | 0.117 | 0.397 | 1.355 |
| 3.414999999999886 | 0.116 | 0.396 | 1.354 |
| 3.419999999999886 | 0.116 | 0.396 | 1.353 |
| 3.424999999999886 | 0.115 | 0.395 | 1.352 |
| 3.429999999999886 | 0.115 | 0.394 | 1.351 |
| 3.434999999999886 | 0.114 | 0.393 | 1.35 |
| 3.439999999999886 | 0.114 | 0.392 | 1.349 |
| 3.444999999999886 | 0.114 | 0.391 | 1.347 |
| 3.449999999999886 | 0.113 | 0.39 | 1.346 |
| 3.454999999999885 | 0.113 | 0.389 | 1.345 |
| 3.459999999999885 | 0.112 | 0.388 | 1.344 |
| 3.464999999999885 | 0.112 | 0.388 | 1.343 |
| 3.469999999999885 | 0.111 | 0.387 | 1.342 |
| 3.474999999999885 | 0.111 | 0.386 | 1.341 |
| 3.479999999999885 | 0.111 | 0.385 | 1.34 |
| 3.484999999999885 | 0.11 | 0.384 | 1.338 |
| 3.489999999999885 | 0.11 | 0.383 | 1.337 |
| 3.494999999999885 | 0.109 | 0.382 | 1.336 |
| 3.499999999999884 | 0.109 | 0.381 | 1.335 |
| 3.504999999999884 | 0.109 | 0.381 | 1.334 |
| 3.509999999999884 | 0.108 | 0.38 | 1.333 |
| 3.514999999999884 | 0.108 | 0.379 | 1.332 |
| 3.519999999999884 | 0.107 | 0.378 | 1.33 |
| 3.524999999999884 | 0.107 | 0.377 | 1.329 |
| 3.529999999999884 | 0.107 | 0.376 | 1.328 |
| 3.534999999999884 | 0.106 | 0.375 | 1.327 |
| 3.539999999999884 | 0.106 | 0.374 | 1.326 |
| 3.544999999999884 | 0.105 | 0.374 | 1.324 |
| 3.549999999999883 | 0.105 | 0.373 | 1.323 |
| 3.554999999999883 | 0.105 | 0.372 | 1.322 |
| 3.559999999999883 | 0.104 | 0.371 | 1.321 |
| 3.564999999999883 | 0.104 | 0.37 | 1.319 |
| 3.569999999999883 | 0.103 | 0.369 | 1.318 |
| 3.574999999999883 | 0.103 | 0.368 | 1.317 |
| 3.579999999999883 | 0.103 | 0.368 | 1.316 |
| 3.584999999999883 | 0.102 | 0.367 | 1.314 |
| 3.589999999999883 | 0.102 | 0.366 | 1.313 |
| 3.594999999999882 | 0.102 | 0.365 | 1.312 |
| 3.599999999999882 | 0.101 | 0.364 | 1.311 |
| 3.604999999999882 | 0.101 | 0.363 | 1.309 |
| 3.609999999999882 | 0.1 | 0.362 | 1.308 |
| 3.614999999999882 | 0.1 | 0.361 | 1.307 |
| 3.619999999999882 | 0.1 | 0.361 | 1.305 |
| 3.624999999999882 | 0.099 | 0.36 | 1.304 |
| 3.629999999999882 | 0.099 | 0.359 | 1.303 |
| 3.634999999999882 | 0.099 | 0.358 | 1.302 |
| 3.639999999999881 | 0.098 | 0.357 | 1.3 |
| 3.644999999999881 | 0.098 | 0.356 | 1.299 |
| 3.649999999999881 | 0.097 | 0.356 | 1.298 |
| 3.654999999999881 | 0.097 | 0.355 | 1.296 |
| 3.659999999999881 | 0.097 | 0.354 | 1.295 |
| 3.664999999999881 | 0.096 | 0.353 | 1.294 |
| 3.669999999999881 | 0.096 | 0.352 | 1.292 |
| 3.674999999999881 | 0.096 | 0.351 | 1.291 |
| 3.679999999999881 | 0.095 | 0.35 | 1.29 |
| 3.68499999999988 | 0.095 | 0.35 | 1.288 |
| 3.68999999999988 | 0.095 | 0.349 | 1.287 |
| 3.69499999999988 | 0.094 | 0.348 | 1.285 |
| 3.69999999999988 | 0.094 | 0.347 | 1.284 |
| 3.70499999999988 | 0.093 | 0.346 | 1.283 |
| 3.70999999999988 | 0.093 | 0.345 | 1.281 |
| 3.71499999999988 | 0.093 | 0.345 | 1.28 |
| 3.71999999999988 | 0.092 | 0.344 | 1.279 |
| 3.72499999999988 | 0.092 | 0.343 | 1.277 |
| 3.72999999999988 | 0.092 | 0.342 | 1.276 |
| 3.734999999999879 | 0.091 | 0.341 | 1.274 |
| 3.739999999999879 | 0.091 | 0.34 | 1.273 |
| 3.744999999999879 | 0.091 | 0.34 | 1.271 |
| 3.749999999999879 | 0.09 | 0.339 | 1.27 |
| 3.754999999999879 | 0.09 | 0.338 | 1.269 |
| 3.759999999999879 | 0.09 | 0.337 | 1.267 |
| 3.764999999999879 | 0.089 | 0.336 | 1.266 |
| 3.769999999999879 | 0.089 | 0.335 | 1.264 |
| 3.774999999999879 | 0.089 | 0.335 | 1.263 |
| 3.779999999999878 | 0.088 | 0.334 | 1.261 |
| 3.784999999999878 | 0.088 | 0.333 | 1.26 |
| 3.789999999999878 | 0.088 | 0.332 | 1.259 |
| 3.794999999999878 | 0.087 | 0.331 | 1.257 |
| 3.799999999999878 | 0.087 | 0.33 | 1.256 |
| 3.804999999999878 | 0.087 | 0.33 | 1.254 |
| 3.809999999999878 | 0.086 | 0.329 | 1.253 |
| 3.814999999999878 | 0.086 | 0.328 | 1.251 |
| 3.819999999999878 | 0.086 | 0.327 | 1.25 |
| 3.824999999999878 | 0.085 | 0.326 | 1.248 |
| 3.829999999999877 | 0.085 | 0.326 | 1.247 |
| 3.834999999999877 | 0.085 | 0.325 | 1.245 |
| 3.839999999999877 | 0.084 | 0.324 | 1.244 |
| 3.844999999999877 | 0.084 | 0.323 | 1.242 |
| 3.849999999999877 | 0.084 | 0.322 | 1.241 |
| 3.854999999999877 | 0.083 | 0.321 | 1.239 |
| 3.859999999999877 | 0.083 | 0.321 | 1.238 |
| 3.864999999999877 | 0.083 | 0.32 | 1.236 |
| 3.869999999999877 | 0.082 | 0.319 | 1.235 |
| 3.874999999999876 | 0.082 | 0.318 | 1.233 |
| 3.879999999999876 | 0.082 | 0.317 | 1.232 |
| 3.884999999999876 | 0.082 | 0.317 | 1.23 |
| 3.889999999999876 | 0.081 | 0.316 | 1.229 |
| 3.894999999999876 | 0.081 | 0.315 | 1.227 |
| 3.899999999999876 | 0.081 | 0.314 | 1.226 |
| 3.904999999999876 | 0.08 | 0.313 | 1.224 |
| 3.909999999999876 | 0.08 | 0.313 | 1.222 |
| 3.914999999999876 | 0.08 | 0.312 | 1.221 |
| 3.919999999999876 | 0.079 | 0.311 | 1.219 |
| 3.924999999999875 | 0.079 | 0.31 | 1.218 |
| 3.929999999999875 | 0.079 | 0.309 | 1.216 |
| 3.934999999999875 | 0.078 | 0.309 | 1.215 |
| 3.939999999999875 | 0.078 | 0.308 | 1.213 |
| 3.944999999999875 | 0.078 | 0.307 | 1.212 |
| 3.949999999999875 | 0.078 | 0.306 | 1.21 |
| 3.954999999999875 | 0.077 | 0.306 | 1.208 |
| 3.959999999999875 | 0.077 | 0.305 | 1.207 |
| 3.964999999999875 | 0.077 | 0.304 | 1.205 |
| 3.969999999999874 | 0.076 | 0.303 | 1.204 |
| 3.974999999999874 | 0.076 | 0.302 | 1.202 |
| 3.979999999999874 | 0.076 | 0.302 | 1.2 |
| 3.984999999999874 | 0.075 | 0.301 | 1.199 |
| 3.989999999999874 | 0.075 | 0.3 | 1.197 |
| 3.994999999999874 | 0.075 | 0.299 | 1.196 |
| 3.999999999999874 | 0.075 | 0.299 | 1.194 |
| 4.004999999999874 | 0.074 | 0.298 | 1.192 |
| 4.009999999999873 | 0.074 | 0.297 | 1.191 |
| 4.014999999999874 | 0.074 | 0.296 | 1.189 |
| 4.019999999999873 | 0.073 | 0.295 | 1.188 |
| 4.024999999999873 | 0.073 | 0.295 | 1.186 |
| 4.029999999999873 | 0.073 | 0.294 | 1.184 |
| 4.034999999999873 | 0.073 | 0.293 | 1.183 |
| 4.039999999999873 | 0.072 | 0.292 | 1.181 |
| 4.044999999999873 | 0.072 | 0.292 | 1.18 |
| 4.049999999999872 | 0.072 | 0.291 | 1.178 |
| 4.054999999999873 | 0.072 | 0.29 | 1.176 |
| 4.059999999999872 | 0.071 | 0.289 | 1.175 |
| 4.064999999999872 | 0.071 | 0.289 | 1.173 |
| 4.069999999999872 | 0.071 | 0.288 | 1.171 |
| 4.074999999999872 | 0.07 | 0.287 | 1.17 |
| 4.079999999999872 | 0.07 | 0.286 | 1.168 |
| 4.084999999999872 | 0.07 | 0.286 | 1.166 |
| 4.089999999999871 | 0.07 | 0.285 | 1.165 |
| 4.094999999999872 | 0.069 | 0.284 | 1.163 |
| 4.099999999999871 | 0.069 | 0.283 | 1.161 |
| 4.104999999999872 | 0.069 | 0.283 | 1.16 |
| 4.109999999999871 | 0.069 | 0.282 | 1.158 |
| 4.114999999999871 | 0.068 | 0.281 | 1.156 |
| 4.119999999999871 | 0.068 | 0.28 | 1.155 |
| 4.124999999999871 | 0.068 | 0.28 | 1.153 |
| 4.129999999999871 | 0.068 | 0.279 | 1.151 |
| 4.134999999999871 | 0.067 | 0.278 | 1.15 |
| 4.13999999999987 | 0.067 | 0.277 | 1.148 |
| 4.144999999999871 | 0.067 | 0.277 | 1.146 |
| 4.14999999999987 | 0.066 | 0.276 | 1.145 |
| 4.154999999999871 | 0.066 | 0.275 | 1.143 |
| 4.15999999999987 | 0.066 | 0.274 | 1.141 |
| 4.16499999999987 | 0.066 | 0.274 | 1.14 |
| 4.16999999999987 | 0.065 | 0.273 | 1.138 |
| 4.17499999999987 | 0.065 | 0.272 | 1.136 |
| 4.17999999999987 | 0.065 | 0.271 | 1.135 |
| 4.18499999999987 | 0.065 | 0.271 | 1.133 |
| 4.18999999999987 | 0.064 | 0.27 | 1.131 |
| 4.19499999999987 | 0.064 | 0.269 | 1.13 |
| 4.19999999999987 | 0.064 | 0.269 | 1.128 |
| 4.20499999999987 | 0.064 | 0.268 | 1.126 |
| 4.20999999999987 | 0.063 | 0.267 | 1.125 |
| 4.21499999999987 | 0.063 | 0.266 | 1.123 |
| 4.21999999999987 | 0.063 | 0.266 | 1.121 |
| 4.22499999999987 | 0.063 | 0.265 | 1.119 |
| 4.229999999999868 | 0.062 | 0.264 | 1.118 |
| 4.234999999999868 | 0.062 | 0.264 | 1.116 |
| 4.239999999999868 | 0.062 | 0.263 | 1.114 |
| 4.244999999999868 | 0.062 | 0.262 | 1.113 |
| 4.249999999999868 | 0.062 | 0.261 | 1.111 |
| 4.254999999999868 | 0.061 | 0.261 | 1.109 |
| 4.259999999999868 | 0.061 | 0.26 | 1.107 |
| 4.264999999999868 | 0.061 | 0.259 | 1.106 |
| 4.269999999999868 | 0.061 | 0.259 | 1.104 |
| 4.274999999999867 | 0.06 | 0.258 | 1.102 |
| 4.279999999999867 | 0.06 | 0.257 | 1.101 |
| 4.284999999999867 | 0.06 | 0.256 | 1.099 |
| 4.289999999999867 | 0.06 | 0.256 | 1.097 |
| 4.294999999999867 | 0.059 | 0.255 | 1.095 |
| 4.299999999999867 | 0.059 | 0.254 | 1.094 |
| 4.304999999999867 | 0.059 | 0.254 | 1.092 |
| 4.309999999999867 | 0.059 | 0.253 | 1.09 |
| 4.314999999999867 | 0.058 | 0.252 | 1.088 |
| 4.319999999999867 | 0.058 | 0.252 | 1.087 |
| 4.324999999999867 | 0.058 | 0.251 | 1.085 |
| 4.329999999999866 | 0.058 | 0.25 | 1.083 |
| 4.334999999999866 | 0.058 | 0.249 | 1.082 |
| 4.339999999999866 | 0.057 | 0.249 | 1.08 |
| 4.344999999999866 | 0.057 | 0.248 | 1.078 |
| 4.349999999999866 | 0.057 | 0.247 | 1.076 |
| 4.354999999999866 | 0.057 | 0.247 | 1.075 |
| 4.359999999999866 | 0.056 | 0.246 | 1.073 |
| 4.364999999999866 | 0.056 | 0.245 | 1.071 |
| 4.369999999999865 | 0.056 | 0.245 | 1.069 |
| 4.374999999999865 | 0.056 | 0.244 | 1.068 |
| 4.379999999999865 | 0.056 | 0.243 | 1.066 |
| 4.384999999999865 | 0.055 | 0.243 | 1.064 |
| 4.389999999999865 | 0.055 | 0.242 | 1.062 |
| 4.394999999999865 | 0.055 | 0.241 | 1.061 |
| 4.399999999999865 | 0.055 | 0.241 | 1.059 |
| 4.404999999999865 | 0.054 | 0.24 | 1.057 |
| 4.409999999999865 | 0.054 | 0.239 | 1.055 |
| 4.414999999999865 | 0.054 | 0.239 | 1.054 |
| 4.419999999999864 | 0.054 | 0.238 | 1.052 |
| 4.424999999999864 | 0.054 | 0.237 | 1.05 |
| 4.429999999999864 | 0.053 | 0.237 | 1.048 |
| 4.434999999999864 | 0.053 | 0.236 | 1.047 |
| 4.439999999999864 | 0.053 | 0.235 | 1.045 |
| 4.444999999999864 | 0.053 | 0.235 | 1.043 |
| 4.449999999999864 | 0.053 | 0.234 | 1.041 |
| 4.454999999999864 | 0.052 | 0.233 | 1.04 |
| 4.459999999999864 | 0.052 | 0.233 | 1.038 |
| 4.464999999999864 | 0.052 | 0.232 | 1.036 |
| 4.469999999999863 | 0.052 | 0.231 | 1.034 |
| 4.474999999999863 | 0.052 | 0.231 | 1.032 |
| 4.479999999999863 | 0.051 | 0.23 | 1.031 |
| 4.484999999999863 | 0.051 | 0.229 | 1.029 |
| 4.489999999999863 | 0.051 | 0.229 | 1.027 |
| 4.494999999999863 | 0.051 | 0.228 | 1.025 |
| 4.499999999999863 | 0.051 | 0.227 | 1.024 |
| 4.504999999999863 | 0.05 | 0.227 | 1.022 |
| 4.509999999999863 | 0.05 | 0.226 | 1.02 |
| 4.514999999999863 | 0.05 | 0.226 | 1.018 |
| 4.519999999999862 | 0.05 | 0.225 | 1.017 |
| 4.524999999999863 | 0.05 | 0.224 | 1.015 |
| 4.529999999999862 | 0.049 | 0.224 | 1.013 |
| 4.534999999999862 | 0.049 | 0.223 | 1.011 |
| 4.539999999999862 | 0.049 | 0.222 | 1.01 |
| 4.544999999999862 | 0.049 | 0.222 | 1.008 |
| 4.549999999999862 | 0.049 | 0.221 | 1.006 |
| 4.554999999999862 | 0.048 | 0.22 | 1.004 |
| 4.559999999999861 | 0.048 | 0.22 | 1.002 |
| 4.564999999999862 | 0.048 | 0.219 | 1.001 |
| 4.569999999999861 | 0.048 | 0.219 | 0.999 |
| 4.574999999999861 | 0.048 | 0.218 | 0.997 |
| 4.57999999999986 | 0.047 | 0.217 | 0.995 |
| 4.584999999999861 | 0.047 | 0.217 | 0.994 |
| 4.58999999999986 | 0.047 | 0.216 | 0.992 |
| 4.594999999999861 | 0.047 | 0.215 | 0.99 |
| 4.59999999999986 | 0.047 | 0.215 | 0.988 |
| 4.604999999999861 | 0.047 | 0.214 | 0.987 |
| 4.60999999999986 | 0.046 | 0.214 | 0.985 |
| 4.614999999999861 | 0.046 | 0.213 | 0.983 |
| 4.61999999999986 | 0.046 | 0.212 | 0.981 |
| 4.62499999999986 | 0.046 | 0.212 | 0.979 |
| 4.62999999999986 | 0.046 | 0.211 | 0.978 |
| 4.63499999999986 | 0.045 | 0.211 | 0.976 |
| 4.63999999999986 | 0.045 | 0.21 | 0.974 |
| 4.64499999999986 | 0.045 | 0.209 | 0.972 |
| 4.64999999999986 | 0.045 | 0.209 | 0.971 |
| 4.65499999999986 | 0.045 | 0.208 | 0.969 |
| 4.65999999999986 | 0.045 | 0.208 | 0.967 |
| 4.66499999999986 | 0.044 | 0.207 | 0.965 |
| 4.669999999999859 | 0.044 | 0.206 | 0.964 |
| 4.674999999999859 | 0.044 | 0.206 | 0.962 |
| 4.67999999999986 | 0.044 | 0.205 | 0.96 |
| 4.684999999999859 | 0.044 | 0.205 | 0.958 |
| 4.68999999999986 | 0.043 | 0.204 | 0.957 |
| 4.694999999999859 | 0.043 | 0.203 | 0.955 |
| 4.699999999999859 | 0.043 | 0.203 | 0.953 |
| 4.704999999999859 | 0.043 | 0.202 | 0.951 |
| 4.709999999999858 | 0.043 | 0.202 | 0.949 |
| 4.714999999999859 | 0.043 | 0.201 | 0.948 |
| 4.719999999999858 | 0.042 | 0.2 | 0.946 |
| 4.724999999999858 | 0.042 | 0.2 | 0.944 |
| 4.729999999999858 | 0.042 | 0.199 | 0.942 |
| 4.734999999999858 | 0.042 | 0.199 | 0.941 |
| 4.739999999999858 | 0.042 | 0.198 | 0.939 |
| 4.744999999999858 | 0.042 | 0.197 | 0.937 |
| 4.749999999999857 | 0.041 | 0.197 | 0.935 |
| 4.754999999999858 | 0.041 | 0.196 | 0.934 |
| 4.759999999999857 | 0.041 | 0.196 | 0.932 |
| 4.764999999999857 | 0.041 | 0.195 | 0.93 |
| 4.769999999999857 | 0.041 | 0.195 | 0.928 |
| 4.774999999999857 | 0.041 | 0.194 | 0.926 |
| 4.779999999999857 | 0.04 | 0.193 | 0.925 |
| 4.784999999999857 | 0.04 | 0.193 | 0.923 |
| 4.789999999999856 | 0.04 | 0.192 | 0.921 |
| 4.794999999999857 | 0.04 | 0.192 | 0.919 |
| 4.799999999999856 | 0.04 | 0.191 | 0.918 |
| 4.804999999999857 | 0.04 | 0.191 | 0.916 |
| 4.809999999999856 | 0.04 | 0.19 | 0.914 |
| 4.814999999999856 | 0.039 | 0.189 | 0.912 |
| 4.819999999999856 | 0.039 | 0.189 | 0.911 |
| 4.824999999999856 | 0.039 | 0.188 | 0.909 |
| 4.829999999999856 | 0.039 | 0.188 | 0.907 |
| 4.834999999999856 | 0.039 | 0.187 | 0.905 |
| 4.839999999999855 | 0.039 | 0.187 | 0.904 |
| 4.844999999999856 | 0.038 | 0.186 | 0.902 |
| 4.849999999999855 | 0.038 | 0.186 | 0.9 |
| 4.854999999999856 | 0.038 | 0.185 | 0.898 |
| 4.859999999999855 | 0.038 | 0.184 | 0.897 |
| 4.864999999999855 | 0.038 | 0.184 | 0.895 |
| 4.869999999999855 | 0.038 | 0.183 | 0.893 |
| 4.874999999999855 | 0.038 | 0.183 | 0.891 |
| 4.879999999999855 | 0.037 | 0.182 | 0.89 |
| 4.884999999999855 | 0.037 | 0.182 | 0.888 |
| 4.889999999999854 | 0.037 | 0.181 | 0.886 |
| 4.894999999999855 | 0.037 | 0.181 | 0.884 |
| 4.899999999999854 | 0.037 | 0.18 | 0.883 |
| 4.904999999999854 | 0.037 | 0.18 | 0.881 |
| 4.909999999999854 | 0.036 | 0.179 | 0.879 |
| 4.914999999999854 | 0.036 | 0.179 | 0.877 |
| 4.919999999999854 | 0.036 | 0.178 | 0.876 |
| 4.924999999999854 | 0.036 | 0.177 | 0.874 |
| 4.929999999999854 | 0.036 | 0.177 | 0.872 |
| 4.934999999999854 | 0.036 | 0.176 | 0.87 |
| 4.939999999999853 | 0.036 | 0.176 | 0.869 |
| 4.944999999999854 | 0.035 | 0.175 | 0.867 |
| 4.949999999999853 | 0.035 | 0.175 | 0.865 |
| 4.954999999999853 | 0.035 | 0.174 | 0.864 |
| 4.959999999999853 | 0.035 | 0.174 | 0.862 |
| 4.964999999999853 | 0.035 | 0.173 | 0.86 |
| 4.969999999999853 | 0.035 | 0.173 | 0.858 |
| 4.974999999999853 | 0.035 | 0.172 | 0.857 |
| 4.979999999999852 | 0.034 | 0.172 | 0.855 |
| 4.984999999999853 | 0.034 | 0.171 | 0.853 |
| 4.989999999999852 | 0.034 | 0.171 | 0.851 |
| 4.994999999999853 | 0.034 | 0.17 | 0.85 |
| 4.999999999999852 | 0.034 | 0.17 | 0.848 |
| 5.004999999999852 | 0.034 | 0.169 | 0.846 |
| 5.009999999999852 | 0.034 | 0.169 | 0.845 |
| 5.014999999999852 | 0.034 | 0.168 | 0.843 |
| 5.019999999999852 | 0.033 | 0.168 | 0.841 |
| 5.024999999999852 | 0.033 | 0.167 | 0.839 |
| 5.029999999999852 | 0.033 | 0.167 | 0.838 |
| 5.034999999999852 | 0.033 | 0.166 | 0.836 |
| 5.039999999999851 | 0.033 | 0.166 | 0.834 |
| 5.044999999999852 | 0.033 | 0.165 | 0.832 |
| 5.049999999999851 | 0.033 | 0.165 | 0.831 |
| 5.054999999999851 | 0.032 | 0.164 | 0.829 |
| 5.059999999999851 | 0.032 | 0.164 | 0.827 |
| 5.064999999999851 | 0.032 | 0.163 | 0.826 |
| 5.069999999999851 | 0.032 | 0.163 | 0.824 |
| 5.074999999999851 | 0.032 | 0.162 | 0.822 |
| 5.07999999999985 | 0.032 | 0.162 | 0.821 |
| 5.084999999999851 | 0.032 | 0.161 | 0.819 |
| 5.08999999999985 | 0.032 | 0.161 | 0.817 |
| 5.094999999999851 | 0.031 | 0.16 | 0.815 |
| 5.09999999999985 | 0.031 | 0.16 | 0.814 |
| 5.10499999999985 | 0.031 | 0.159 | 0.812 |
| 5.10999999999985 | 0.031 | 0.159 | 0.81 |
| 5.11499999999985 | 0.031 | 0.158 | 0.809 |
| 5.11999999999985 | 0.031 | 0.158 | 0.807 |
| 5.12499999999985 | 0.031 | 0.157 | 0.805 |
| 5.12999999999985 | 0.031 | 0.157 | 0.804 |
| 5.13499999999985 | 0.03 | 0.156 | 0.802 |
| 5.13999999999985 | 0.03 | 0.156 | 0.8 |
| 5.144999999999849 | 0.03 | 0.155 | 0.798 |
| 5.14999999999985 | 0.03 | 0.155 | 0.797 |
| 5.154999999999849 | 0.03 | 0.154 | 0.795 |
| 5.15999999999985 | 0.03 | 0.154 | 0.793 |
| 5.164999999999849 | 0.03 | 0.153 | 0.792 |
| 5.169999999999849 | 0.03 | 0.153 | 0.79 |
| 5.174999999999849 | 0.029 | 0.152 | 0.788 |
| 5.179999999999848 | 0.029 | 0.152 | 0.787 |
| 5.184999999999849 | 0.029 | 0.151 | 0.785 |
| 5.189999999999848 | 0.029 | 0.151 | 0.783 |
| 5.194999999999848 | 0.029 | 0.15 | 0.782 |
| 5.199999999999848 | 0.029 | 0.15 | 0.78 |
| 5.204999999999848 | 0.029 | 0.15 | 0.778 |
| 5.209999999999848 | 0.029 | 0.149 | 0.777 |
| 5.214999999999848 | 0.028 | 0.149 | 0.775 |
| 5.219999999999847 | 0.028 | 0.148 | 0.773 |
| 5.224999999999848 | 0.028 | 0.148 | 0.772 |
| 5.229999999999847 | 0.028 | 0.147 | 0.77 |
| 5.234999999999847 | 0.028 | 0.147 | 0.768 |
| 5.239999999999847 | 0.028 | 0.146 | 0.767 |
| 5.244999999999847 | 0.028 | 0.146 | 0.765 |
| 5.249999999999847 | 0.028 | 0.145 | 0.763 |
| 5.254999999999847 | 0.028 | 0.145 | 0.762 |
| 5.259999999999846 | 0.027 | 0.144 | 0.76 |
| 5.264999999999847 | 0.027 | 0.144 | 0.758 |
| 5.269999999999846 | 0.027 | 0.144 | 0.757 |
| 5.274999999999846 | 0.027 | 0.143 | 0.755 |
| 5.279999999999846 | 0.027 | 0.143 | 0.753 |
| 5.284999999999846 | 0.027 | 0.142 | 0.752 |
| 5.289999999999846 | 0.027 | 0.142 | 0.75 |
| 5.294999999999846 | 0.027 | 0.141 | 0.749 |
| 5.299999999999846 | 0.027 | 0.141 | 0.747 |
| 5.304999999999846 | 0.026 | 0.14 | 0.745 |
| 5.309999999999845 | 0.026 | 0.14 | 0.744 |
| 5.314999999999846 | 0.026 | 0.14 | 0.742 |
| 5.319999999999845 | 0.026 | 0.139 | 0.74 |
| 5.324999999999846 | 0.026 | 0.139 | 0.739 |
| 5.329999999999845 | 0.026 | 0.138 | 0.737 |
| 5.334999999999845 | 0.026 | 0.138 | 0.735 |
| 5.339999999999845 | 0.026 | 0.137 | 0.734 |
| 5.344999999999845 | 0.026 | 0.137 | 0.732 |
| 5.349999999999845 | 0.026 | 0.137 | 0.731 |
| 5.354999999999845 | 0.025 | 0.136 | 0.729 |
| 5.359999999999844 | 0.025 | 0.136 | 0.727 |
| 5.364999999999845 | 0.025 | 0.135 | 0.726 |
| 5.369999999999844 | 0.025 | 0.135 | 0.724 |
| 5.374999999999844 | 0.025 | 0.134 | 0.722 |
| 5.379999999999844 | 0.025 | 0.134 | 0.721 |
| 5.384999999999844 | 0.025 | 0.134 | 0.719 |
| 5.389999999999844 | 0.025 | 0.133 | 0.718 |
| 5.394999999999844 | 0.025 | 0.133 | 0.716 |
| 5.399999999999844 | 0.025 | 0.132 | 0.714 |
| 5.404999999999844 | 0.024 | 0.132 | 0.713 |
| 5.409999999999843 | 0.024 | 0.131 | 0.711 |
| 5.414999999999844 | 0.024 | 0.131 | 0.71 |
| 5.419999999999843 | 0.024 | 0.131 | 0.708 |
| 5.424999999999843 | 0.024 | 0.13 | 0.706 |
| 5.429999999999843 | 0.024 | 0.13 | 0.705 |
| 5.434999999999843 | 0.024 | 0.129 | 0.703 |
| 5.439999999999843 | 0.024 | 0.129 | 0.702 |
| 5.444999999999843 | 0.024 | 0.129 | 0.7 |
| 5.449999999999842 | 0.024 | 0.128 | 0.698 |
| 5.454999999999843 | 0.023 | 0.128 | 0.697 |
| 5.459999999999842 | 0.023 | 0.127 | 0.695 |
| 5.464999999999843 | 0.023 | 0.127 | 0.694 |
| 5.469999999999842 | 0.023 | 0.127 | 0.692 |
| 5.474999999999842 | 0.023 | 0.126 | 0.691 |
| 5.479999999999842 | 0.023 | 0.126 | 0.689 |
| 5.484999999999842 | 0.023 | 0.125 | 0.687 |
| 5.489999999999842 | 0.023 | 0.125 | 0.686 |
| 5.494999999999842 | 0.023 | 0.125 | 0.684 |
| 5.499999999999841 | 0.023 | 0.124 | 0.683 |
| 5.504999999999842 | 0.022 | 0.124 | 0.681 |
| 5.509999999999841 | 0.022 | 0.123 | 0.68 |
| 5.514999999999842 | 0.022 | 0.123 | 0.678 |
| 5.519999999999841 | 0.022 | 0.123 | 0.676 |
| 5.524999999999841 | 0.022 | 0.122 | 0.675 |
| 5.529999999999841 | 0.022 | 0.122 | 0.673 |
| 5.534999999999841 | 0.022 | 0.121 | 0.672 |
| 5.53999999999984 | 0.022 | 0.121 | 0.67 |
| 5.544999999999841 | 0.022 | 0.121 | 0.669 |
| 5.54999999999984 | 0.022 | 0.12 | 0.667 |
| 5.554999999999841 | 0.022 | 0.12 | 0.666 |
| 5.55999999999984 | 0.021 | 0.119 | 0.664 |
| 5.564999999999841 | 0.021 | 0.119 | 0.663 |
| 5.56999999999984 | 0.021 | 0.119 | 0.661 |
| 5.57499999999984 | 0.021 | 0.118 | 0.659 |
| 5.57999999999984 | 0.021 | 0.118 | 0.658 |
| 5.58499999999984 | 0.021 | 0.118 | 0.656 |
| 5.58999999999984 | 0.021 | 0.117 | 0.655 |
| 5.59499999999984 | 0.021 | 0.117 | 0.653 |
| 5.59999999999984 | 0.021 | 0.116 | 0.652 |
| 5.60499999999984 | 0.021 | 0.116 | 0.65 |
| 5.60999999999984 | 0.021 | 0.116 | 0.649 |
| 5.614999999999839 | 0.021 | 0.115 | 0.647 |
| 5.61999999999984 | 0.02 | 0.115 | 0.646 |
| 5.624999999999839 | 0.02 | 0.115 | 0.644 |
| 5.62999999999984 | 0.02 | 0.114 | 0.643 |
| 5.634999999999839 | 0.02 | 0.114 | 0.641 |
| 5.639999999999838 | 0.02 | 0.113 | 0.64 |
| 5.644999999999839 | 0.02 | 0.113 | 0.638 |
| 5.649999999999838 | 0.02 | 0.113 | 0.637 |
| 5.654999999999839 | 0.02 | 0.112 | 0.635 |
| 5.659999999999838 | 0.02 | 0.112 | 0.634 |
| 5.664999999999838 | 0.02 | 0.112 | 0.632 |
| 5.669999999999838 | 0.02 | 0.111 | 0.631 |
| 5.674999999999838 | 0.02 | 0.111 | 0.629 |
| 5.679999999999837 | 0.019 | 0.111 | 0.628 |
| 5.684999999999838 | 0.019 | 0.11 | 0.626 |
| 5.689999999999837 | 0.019 | 0.11 | 0.625 |
| 5.694999999999838 | 0.019 | 0.109 | 0.623 |
| 5.699999999999837 | 0.019 | 0.109 | 0.622 |
| 5.704999999999837 | 0.019 | 0.109 | 0.62 |
| 5.709999999999837 | 0.019 | 0.108 | 0.619 |
| 5.714999999999837 | 0.019 | 0.108 | 0.617 |
| 5.719999999999837 | 0.019 | 0.108 | 0.616 |
| 5.724999999999837 | 0.019 | 0.107 | 0.614 |
| 5.729999999999836 | 0.019 | 0.107 | 0.613 |
| 5.734999999999836 | 0.019 | 0.107 | 0.611 |
| 5.739999999999836 | 0.019 | 0.106 | 0.61 |
| 5.744999999999836 | 0.018 | 0.106 | 0.608 |
| 5.749999999999836 | 0.018 | 0.106 | 0.607 |
| 5.754999999999836 | 0.018 | 0.105 | 0.606 |
| 5.759999999999836 | 0.018 | 0.105 | 0.604 |
| 5.764999999999836 | 0.018 | 0.105 | 0.603 |
| 5.769999999999836 | 0.018 | 0.104 | 0.601 |
| 5.774999999999835 | 0.018 | 0.104 | 0.6 |
| 5.779999999999835 | 0.018 | 0.104 | 0.598 |
| 5.784999999999835 | 0.018 | 0.103 | 0.597 |
| 5.789999999999835 | 0.018 | 0.103 | 0.595 |
| 5.794999999999835 | 0.018 | 0.102 | 0.594 |
| 5.799999999999835 | 0.018 | 0.102 | 0.593 |
| 5.804999999999835 | 0.018 | 0.102 | 0.591 |
| 5.809999999999835 | 0.017 | 0.101 | 0.59 |
| 5.814999999999835 | 0.017 | 0.101 | 0.588 |
| 5.819999999999835 | 0.017 | 0.101 | 0.587 |
| 5.824999999999835 | 0.017 | 0.1 | 0.585 |
| 5.829999999999834 | 0.017 | 0.1 | 0.584 |
| 5.834999999999834 | 0.017 | 0.1 | 0.582 |
| 5.839999999999834 | 0.017 | 0.099 | 0.581 |
| 5.844999999999834 | 0.017 | 0.099 | 0.58 |
| 5.849999999999834 | 0.017 | 0.099 | 0.578 |
| 5.854999999999834 | 0.017 | 0.099 | 0.577 |
| 5.859999999999834 | 0.017 | 0.098 | 0.575 |
| 5.864999999999834 | 0.017 | 0.098 | 0.574 |
| 5.869999999999834 | 0.017 | 0.098 | 0.573 |
| 5.874999999999834 | 0.017 | 0.097 | 0.571 |
| 5.879999999999833 | 0.016 | 0.097 | 0.57 |
| 5.884999999999834 | 0.016 | 0.097 | 0.568 |
| 5.889999999999833 | 0.016 | 0.096 | 0.567 |
| 5.894999999999833 | 0.016 | 0.096 | 0.566 |
| 5.899999999999833 | 0.016 | 0.096 | 0.564 |
| 5.904999999999833 | 0.016 | 0.095 | 0.563 |
| 5.909999999999833 | 0.016 | 0.095 | 0.561 |
| 5.914999999999833 | 0.016 | 0.095 | 0.56 |
| 5.919999999999832 | 0.016 | 0.094 | 0.559 |
| 5.924999999999833 | 0.016 | 0.094 | 0.557 |
| 5.929999999999832 | 0.016 | 0.094 | 0.556 |
| 5.934999999999832 | 0.016 | 0.093 | 0.554 |
| 5.939999999999832 | 0.016 | 0.093 | 0.553 |
| 5.944999999999832 | 0.016 | 0.093 | 0.552 |
| 5.949999999999832 | 0.016 | 0.092 | 0.55 |
| 5.954999999999832 | 0.015 | 0.092 | 0.549 |
| 5.959999999999832 | 0.015 | 0.092 | 0.548 |
| 5.964999999999832 | 0.015 | 0.092 | 0.546 |
| 5.969999999999831 | 0.015 | 0.091 | 0.545 |
| 5.974999999999831 | 0.015 | 0.091 | 0.544 |
| 5.97999999999983 | 0.015 | 0.091 | 0.542 |
| 5.984999999999831 | 0.015 | 0.09 | 0.541 |
| 5.98999999999983 | 0.015 | 0.09 | 0.539 |
| 5.994999999999831 | 0.015 | 0.09 | 0.538 |
| 5.99999999999983 | 0.015 | 0.089 | 0.537 |